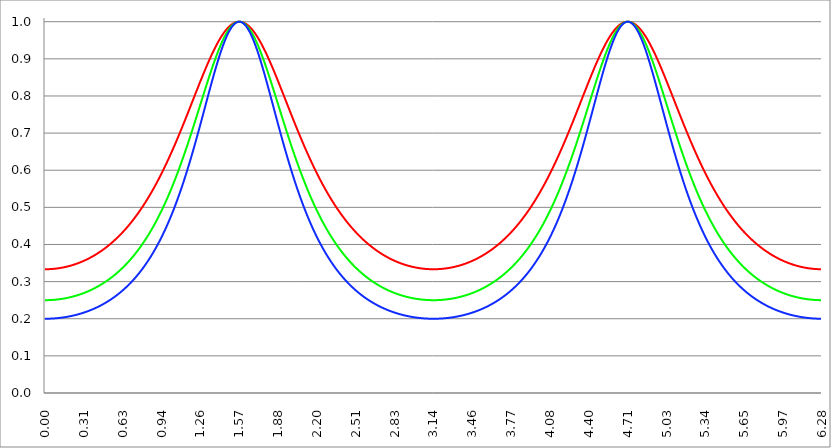
| Category | Series 1 | Series 0 | Series 2 |
|---|---|---|---|
| 0.0 | 0.333 | 0.25 | 0.2 |
| 0.00314159265358979 | 0.333 | 0.25 | 0.2 |
| 0.00628318530717958 | 0.333 | 0.25 | 0.2 |
| 0.00942477796076938 | 0.333 | 0.25 | 0.2 |
| 0.0125663706143592 | 0.333 | 0.25 | 0.2 |
| 0.015707963267949 | 0.333 | 0.25 | 0.2 |
| 0.0188495559215388 | 0.333 | 0.25 | 0.2 |
| 0.0219911485751285 | 0.333 | 0.25 | 0.2 |
| 0.0251327412287183 | 0.333 | 0.25 | 0.2 |
| 0.0282743338823081 | 0.334 | 0.25 | 0.2 |
| 0.0314159265358979 | 0.334 | 0.25 | 0.2 |
| 0.0345575191894877 | 0.334 | 0.25 | 0.2 |
| 0.0376991118430775 | 0.334 | 0.25 | 0.2 |
| 0.0408407044966673 | 0.334 | 0.25 | 0.2 |
| 0.0439822971502571 | 0.334 | 0.25 | 0.2 |
| 0.0471238898038469 | 0.334 | 0.25 | 0.2 |
| 0.0502654824574367 | 0.334 | 0.25 | 0.2 |
| 0.0534070751110265 | 0.334 | 0.251 | 0.2 |
| 0.0565486677646163 | 0.334 | 0.251 | 0.201 |
| 0.059690260418206 | 0.334 | 0.251 | 0.201 |
| 0.0628318530717958 | 0.334 | 0.251 | 0.201 |
| 0.0659734457253856 | 0.334 | 0.251 | 0.201 |
| 0.0691150383789754 | 0.334 | 0.251 | 0.201 |
| 0.0722566310325652 | 0.334 | 0.251 | 0.201 |
| 0.075398223686155 | 0.335 | 0.251 | 0.201 |
| 0.0785398163397448 | 0.335 | 0.251 | 0.201 |
| 0.0816814089933346 | 0.335 | 0.251 | 0.201 |
| 0.0848230016469244 | 0.335 | 0.251 | 0.201 |
| 0.0879645943005142 | 0.335 | 0.251 | 0.201 |
| 0.091106186954104 | 0.335 | 0.252 | 0.201 |
| 0.0942477796076937 | 0.335 | 0.252 | 0.201 |
| 0.0973893722612835 | 0.335 | 0.252 | 0.202 |
| 0.100530964914873 | 0.336 | 0.252 | 0.202 |
| 0.103672557568463 | 0.336 | 0.252 | 0.202 |
| 0.106814150222053 | 0.336 | 0.252 | 0.202 |
| 0.109955742875643 | 0.336 | 0.252 | 0.202 |
| 0.113097335529233 | 0.336 | 0.252 | 0.202 |
| 0.116238928182822 | 0.336 | 0.253 | 0.202 |
| 0.119380520836412 | 0.337 | 0.253 | 0.202 |
| 0.122522113490002 | 0.337 | 0.253 | 0.202 |
| 0.125663706143592 | 0.337 | 0.253 | 0.203 |
| 0.128805298797181 | 0.337 | 0.253 | 0.203 |
| 0.131946891450771 | 0.337 | 0.253 | 0.203 |
| 0.135088484104361 | 0.337 | 0.253 | 0.203 |
| 0.138230076757951 | 0.338 | 0.254 | 0.203 |
| 0.141371669411541 | 0.338 | 0.254 | 0.203 |
| 0.14451326206513 | 0.338 | 0.254 | 0.203 |
| 0.14765485471872 | 0.338 | 0.254 | 0.204 |
| 0.15079644737231 | 0.338 | 0.254 | 0.204 |
| 0.1539380400259 | 0.339 | 0.254 | 0.204 |
| 0.15707963267949 | 0.339 | 0.255 | 0.204 |
| 0.160221225333079 | 0.339 | 0.255 | 0.204 |
| 0.163362817986669 | 0.339 | 0.255 | 0.204 |
| 0.166504410640259 | 0.34 | 0.255 | 0.204 |
| 0.169646003293849 | 0.34 | 0.255 | 0.205 |
| 0.172787595947439 | 0.34 | 0.256 | 0.205 |
| 0.175929188601028 | 0.34 | 0.256 | 0.205 |
| 0.179070781254618 | 0.341 | 0.256 | 0.205 |
| 0.182212373908208 | 0.341 | 0.256 | 0.205 |
| 0.185353966561798 | 0.341 | 0.257 | 0.206 |
| 0.188495559215388 | 0.341 | 0.257 | 0.206 |
| 0.191637151868977 | 0.342 | 0.257 | 0.206 |
| 0.194778744522567 | 0.342 | 0.257 | 0.206 |
| 0.197920337176157 | 0.342 | 0.257 | 0.206 |
| 0.201061929829747 | 0.342 | 0.258 | 0.207 |
| 0.204203522483336 | 0.343 | 0.258 | 0.207 |
| 0.207345115136926 | 0.343 | 0.258 | 0.207 |
| 0.210486707790516 | 0.343 | 0.258 | 0.207 |
| 0.213628300444106 | 0.344 | 0.259 | 0.207 |
| 0.216769893097696 | 0.344 | 0.259 | 0.208 |
| 0.219911485751285 | 0.344 | 0.259 | 0.208 |
| 0.223053078404875 | 0.345 | 0.26 | 0.208 |
| 0.226194671058465 | 0.345 | 0.26 | 0.208 |
| 0.229336263712055 | 0.345 | 0.26 | 0.209 |
| 0.232477856365645 | 0.346 | 0.26 | 0.209 |
| 0.235619449019234 | 0.346 | 0.261 | 0.209 |
| 0.238761041672824 | 0.346 | 0.261 | 0.209 |
| 0.241902634326414 | 0.347 | 0.261 | 0.21 |
| 0.245044226980004 | 0.347 | 0.262 | 0.21 |
| 0.248185819633594 | 0.347 | 0.262 | 0.21 |
| 0.251327412287183 | 0.348 | 0.262 | 0.21 |
| 0.254469004940773 | 0.348 | 0.262 | 0.211 |
| 0.257610597594363 | 0.348 | 0.263 | 0.211 |
| 0.260752190247953 | 0.349 | 0.263 | 0.211 |
| 0.263893782901543 | 0.349 | 0.263 | 0.212 |
| 0.267035375555132 | 0.35 | 0.264 | 0.212 |
| 0.270176968208722 | 0.35 | 0.264 | 0.212 |
| 0.273318560862312 | 0.35 | 0.264 | 0.212 |
| 0.276460153515902 | 0.351 | 0.265 | 0.213 |
| 0.279601746169492 | 0.351 | 0.265 | 0.213 |
| 0.282743338823082 | 0.352 | 0.265 | 0.213 |
| 0.285884931476671 | 0.352 | 0.266 | 0.214 |
| 0.289026524130261 | 0.352 | 0.266 | 0.214 |
| 0.292168116783851 | 0.353 | 0.267 | 0.214 |
| 0.295309709437441 | 0.353 | 0.267 | 0.215 |
| 0.298451302091031 | 0.354 | 0.267 | 0.215 |
| 0.30159289474462 | 0.354 | 0.268 | 0.215 |
| 0.30473448739821 | 0.355 | 0.268 | 0.216 |
| 0.3078760800518 | 0.355 | 0.268 | 0.216 |
| 0.31101767270539 | 0.356 | 0.269 | 0.216 |
| 0.31415926535898 | 0.356 | 0.269 | 0.217 |
| 0.31730085801257 | 0.356 | 0.27 | 0.217 |
| 0.320442450666159 | 0.357 | 0.27 | 0.217 |
| 0.323584043319749 | 0.357 | 0.271 | 0.218 |
| 0.326725635973339 | 0.358 | 0.271 | 0.218 |
| 0.329867228626929 | 0.358 | 0.271 | 0.218 |
| 0.333008821280519 | 0.359 | 0.272 | 0.219 |
| 0.336150413934108 | 0.359 | 0.272 | 0.219 |
| 0.339292006587698 | 0.36 | 0.273 | 0.219 |
| 0.342433599241288 | 0.36 | 0.273 | 0.22 |
| 0.345575191894878 | 0.361 | 0.274 | 0.22 |
| 0.348716784548468 | 0.361 | 0.274 | 0.221 |
| 0.351858377202058 | 0.362 | 0.274 | 0.221 |
| 0.354999969855647 | 0.363 | 0.275 | 0.221 |
| 0.358141562509237 | 0.363 | 0.275 | 0.222 |
| 0.361283155162827 | 0.364 | 0.276 | 0.222 |
| 0.364424747816417 | 0.364 | 0.276 | 0.223 |
| 0.367566340470007 | 0.365 | 0.277 | 0.223 |
| 0.370707933123597 | 0.365 | 0.277 | 0.223 |
| 0.373849525777186 | 0.366 | 0.278 | 0.224 |
| 0.376991118430776 | 0.366 | 0.278 | 0.224 |
| 0.380132711084366 | 0.367 | 0.279 | 0.225 |
| 0.383274303737956 | 0.368 | 0.279 | 0.225 |
| 0.386415896391546 | 0.368 | 0.28 | 0.226 |
| 0.389557489045135 | 0.369 | 0.28 | 0.226 |
| 0.392699081698725 | 0.369 | 0.281 | 0.227 |
| 0.395840674352315 | 0.37 | 0.281 | 0.227 |
| 0.398982267005905 | 0.371 | 0.282 | 0.227 |
| 0.402123859659495 | 0.371 | 0.282 | 0.228 |
| 0.405265452313085 | 0.372 | 0.283 | 0.228 |
| 0.408407044966674 | 0.373 | 0.284 | 0.229 |
| 0.411548637620264 | 0.373 | 0.284 | 0.229 |
| 0.414690230273854 | 0.374 | 0.285 | 0.23 |
| 0.417831822927444 | 0.374 | 0.285 | 0.23 |
| 0.420973415581034 | 0.375 | 0.286 | 0.231 |
| 0.424115008234623 | 0.376 | 0.286 | 0.231 |
| 0.427256600888213 | 0.376 | 0.287 | 0.232 |
| 0.430398193541803 | 0.377 | 0.288 | 0.232 |
| 0.433539786195393 | 0.378 | 0.288 | 0.233 |
| 0.436681378848983 | 0.378 | 0.289 | 0.233 |
| 0.439822971502573 | 0.379 | 0.289 | 0.234 |
| 0.442964564156162 | 0.38 | 0.29 | 0.234 |
| 0.446106156809752 | 0.381 | 0.291 | 0.235 |
| 0.449247749463342 | 0.381 | 0.291 | 0.236 |
| 0.452389342116932 | 0.382 | 0.292 | 0.236 |
| 0.455530934770522 | 0.383 | 0.292 | 0.237 |
| 0.458672527424111 | 0.383 | 0.293 | 0.237 |
| 0.461814120077701 | 0.384 | 0.294 | 0.238 |
| 0.464955712731291 | 0.385 | 0.294 | 0.238 |
| 0.468097305384881 | 0.386 | 0.295 | 0.239 |
| 0.471238898038471 | 0.386 | 0.296 | 0.239 |
| 0.474380490692061 | 0.387 | 0.296 | 0.24 |
| 0.47752208334565 | 0.388 | 0.297 | 0.241 |
| 0.48066367599924 | 0.389 | 0.298 | 0.241 |
| 0.48380526865283 | 0.39 | 0.298 | 0.242 |
| 0.48694686130642 | 0.39 | 0.299 | 0.242 |
| 0.49008845396001 | 0.391 | 0.3 | 0.243 |
| 0.493230046613599 | 0.392 | 0.301 | 0.244 |
| 0.496371639267189 | 0.393 | 0.301 | 0.244 |
| 0.499513231920779 | 0.394 | 0.302 | 0.245 |
| 0.502654824574369 | 0.394 | 0.303 | 0.246 |
| 0.505796417227959 | 0.395 | 0.303 | 0.246 |
| 0.508938009881549 | 0.396 | 0.304 | 0.247 |
| 0.512079602535138 | 0.397 | 0.305 | 0.248 |
| 0.515221195188728 | 0.398 | 0.306 | 0.248 |
| 0.518362787842318 | 0.399 | 0.306 | 0.249 |
| 0.521504380495908 | 0.399 | 0.307 | 0.25 |
| 0.524645973149498 | 0.4 | 0.308 | 0.25 |
| 0.527787565803087 | 0.401 | 0.309 | 0.251 |
| 0.530929158456677 | 0.402 | 0.31 | 0.252 |
| 0.534070751110267 | 0.403 | 0.31 | 0.252 |
| 0.537212343763857 | 0.404 | 0.311 | 0.253 |
| 0.540353936417447 | 0.405 | 0.312 | 0.254 |
| 0.543495529071037 | 0.406 | 0.313 | 0.254 |
| 0.546637121724626 | 0.407 | 0.314 | 0.255 |
| 0.549778714378216 | 0.407 | 0.314 | 0.256 |
| 0.552920307031806 | 0.408 | 0.315 | 0.257 |
| 0.556061899685396 | 0.409 | 0.316 | 0.257 |
| 0.559203492338986 | 0.41 | 0.317 | 0.258 |
| 0.562345084992576 | 0.411 | 0.318 | 0.259 |
| 0.565486677646165 | 0.412 | 0.319 | 0.26 |
| 0.568628270299755 | 0.413 | 0.319 | 0.26 |
| 0.571769862953345 | 0.414 | 0.32 | 0.261 |
| 0.574911455606935 | 0.415 | 0.321 | 0.262 |
| 0.578053048260525 | 0.416 | 0.322 | 0.263 |
| 0.581194640914114 | 0.417 | 0.323 | 0.264 |
| 0.584336233567704 | 0.418 | 0.324 | 0.264 |
| 0.587477826221294 | 0.419 | 0.325 | 0.265 |
| 0.590619418874884 | 0.42 | 0.326 | 0.266 |
| 0.593761011528474 | 0.421 | 0.327 | 0.267 |
| 0.596902604182064 | 0.422 | 0.328 | 0.268 |
| 0.600044196835653 | 0.423 | 0.329 | 0.268 |
| 0.603185789489243 | 0.424 | 0.33 | 0.269 |
| 0.606327382142833 | 0.425 | 0.33 | 0.27 |
| 0.609468974796423 | 0.427 | 0.331 | 0.271 |
| 0.612610567450013 | 0.428 | 0.332 | 0.272 |
| 0.615752160103602 | 0.429 | 0.333 | 0.273 |
| 0.618893752757192 | 0.43 | 0.334 | 0.274 |
| 0.622035345410782 | 0.431 | 0.335 | 0.275 |
| 0.625176938064372 | 0.432 | 0.336 | 0.275 |
| 0.628318530717962 | 0.433 | 0.337 | 0.276 |
| 0.631460123371551 | 0.434 | 0.338 | 0.277 |
| 0.634601716025141 | 0.435 | 0.339 | 0.278 |
| 0.637743308678731 | 0.436 | 0.341 | 0.279 |
| 0.640884901332321 | 0.438 | 0.342 | 0.28 |
| 0.644026493985911 | 0.439 | 0.343 | 0.281 |
| 0.647168086639501 | 0.44 | 0.344 | 0.282 |
| 0.65030967929309 | 0.441 | 0.345 | 0.283 |
| 0.65345127194668 | 0.442 | 0.346 | 0.284 |
| 0.65659286460027 | 0.444 | 0.347 | 0.285 |
| 0.65973445725386 | 0.445 | 0.348 | 0.286 |
| 0.66287604990745 | 0.446 | 0.349 | 0.287 |
| 0.666017642561039 | 0.447 | 0.35 | 0.288 |
| 0.669159235214629 | 0.448 | 0.351 | 0.289 |
| 0.672300827868219 | 0.45 | 0.353 | 0.29 |
| 0.675442420521809 | 0.451 | 0.354 | 0.291 |
| 0.678584013175399 | 0.452 | 0.355 | 0.292 |
| 0.681725605828989 | 0.453 | 0.356 | 0.293 |
| 0.684867198482578 | 0.455 | 0.357 | 0.294 |
| 0.688008791136168 | 0.456 | 0.358 | 0.295 |
| 0.691150383789758 | 0.457 | 0.36 | 0.296 |
| 0.694291976443348 | 0.458 | 0.361 | 0.297 |
| 0.697433569096938 | 0.46 | 0.362 | 0.299 |
| 0.700575161750528 | 0.461 | 0.363 | 0.3 |
| 0.703716754404117 | 0.462 | 0.364 | 0.301 |
| 0.706858347057707 | 0.464 | 0.366 | 0.302 |
| 0.709999939711297 | 0.465 | 0.367 | 0.303 |
| 0.713141532364887 | 0.466 | 0.368 | 0.304 |
| 0.716283125018477 | 0.468 | 0.369 | 0.305 |
| 0.719424717672066 | 0.469 | 0.371 | 0.306 |
| 0.722566310325656 | 0.471 | 0.372 | 0.308 |
| 0.725707902979246 | 0.472 | 0.373 | 0.309 |
| 0.728849495632836 | 0.473 | 0.375 | 0.31 |
| 0.731991088286426 | 0.475 | 0.376 | 0.311 |
| 0.735132680940016 | 0.476 | 0.377 | 0.312 |
| 0.738274273593605 | 0.478 | 0.379 | 0.314 |
| 0.741415866247195 | 0.479 | 0.38 | 0.315 |
| 0.744557458900785 | 0.48 | 0.381 | 0.316 |
| 0.747699051554375 | 0.482 | 0.383 | 0.317 |
| 0.750840644207965 | 0.483 | 0.384 | 0.319 |
| 0.753982236861554 | 0.485 | 0.385 | 0.32 |
| 0.757123829515144 | 0.486 | 0.387 | 0.321 |
| 0.760265422168734 | 0.488 | 0.388 | 0.323 |
| 0.763407014822324 | 0.489 | 0.39 | 0.324 |
| 0.766548607475914 | 0.491 | 0.391 | 0.325 |
| 0.769690200129504 | 0.492 | 0.393 | 0.326 |
| 0.772831792783093 | 0.494 | 0.394 | 0.328 |
| 0.775973385436683 | 0.495 | 0.396 | 0.329 |
| 0.779114978090273 | 0.497 | 0.397 | 0.331 |
| 0.782256570743863 | 0.498 | 0.398 | 0.332 |
| 0.785398163397453 | 0.5 | 0.4 | 0.333 |
| 0.788539756051042 | 0.502 | 0.402 | 0.335 |
| 0.791681348704632 | 0.503 | 0.403 | 0.336 |
| 0.794822941358222 | 0.505 | 0.405 | 0.338 |
| 0.797964534011812 | 0.506 | 0.406 | 0.339 |
| 0.801106126665402 | 0.508 | 0.408 | 0.34 |
| 0.804247719318992 | 0.51 | 0.409 | 0.342 |
| 0.807389311972581 | 0.511 | 0.411 | 0.343 |
| 0.810530904626171 | 0.513 | 0.412 | 0.345 |
| 0.813672497279761 | 0.515 | 0.414 | 0.346 |
| 0.816814089933351 | 0.516 | 0.416 | 0.348 |
| 0.819955682586941 | 0.518 | 0.417 | 0.349 |
| 0.823097275240531 | 0.52 | 0.419 | 0.351 |
| 0.82623886789412 | 0.521 | 0.421 | 0.353 |
| 0.82938046054771 | 0.523 | 0.422 | 0.354 |
| 0.8325220532013 | 0.525 | 0.424 | 0.356 |
| 0.83566364585489 | 0.526 | 0.426 | 0.357 |
| 0.83880523850848 | 0.528 | 0.427 | 0.359 |
| 0.841946831162069 | 0.53 | 0.429 | 0.36 |
| 0.845088423815659 | 0.532 | 0.431 | 0.362 |
| 0.848230016469249 | 0.533 | 0.433 | 0.364 |
| 0.851371609122839 | 0.535 | 0.434 | 0.365 |
| 0.854513201776429 | 0.537 | 0.436 | 0.367 |
| 0.857654794430019 | 0.539 | 0.438 | 0.369 |
| 0.860796387083608 | 0.541 | 0.44 | 0.37 |
| 0.863937979737198 | 0.542 | 0.441 | 0.372 |
| 0.867079572390788 | 0.544 | 0.443 | 0.374 |
| 0.870221165044378 | 0.546 | 0.445 | 0.376 |
| 0.873362757697968 | 0.548 | 0.447 | 0.377 |
| 0.876504350351557 | 0.55 | 0.449 | 0.379 |
| 0.879645943005147 | 0.552 | 0.451 | 0.381 |
| 0.882787535658737 | 0.554 | 0.453 | 0.383 |
| 0.885929128312327 | 0.555 | 0.454 | 0.385 |
| 0.889070720965917 | 0.557 | 0.456 | 0.386 |
| 0.892212313619507 | 0.559 | 0.458 | 0.388 |
| 0.895353906273096 | 0.561 | 0.46 | 0.39 |
| 0.898495498926686 | 0.563 | 0.462 | 0.392 |
| 0.901637091580276 | 0.565 | 0.464 | 0.394 |
| 0.904778684233866 | 0.567 | 0.466 | 0.396 |
| 0.907920276887456 | 0.569 | 0.468 | 0.398 |
| 0.911061869541045 | 0.571 | 0.47 | 0.4 |
| 0.914203462194635 | 0.573 | 0.472 | 0.402 |
| 0.917345054848225 | 0.575 | 0.474 | 0.403 |
| 0.920486647501815 | 0.577 | 0.476 | 0.405 |
| 0.923628240155405 | 0.579 | 0.478 | 0.407 |
| 0.926769832808995 | 0.581 | 0.48 | 0.409 |
| 0.929911425462584 | 0.583 | 0.483 | 0.412 |
| 0.933053018116174 | 0.585 | 0.485 | 0.414 |
| 0.936194610769764 | 0.587 | 0.487 | 0.416 |
| 0.939336203423354 | 0.589 | 0.489 | 0.418 |
| 0.942477796076944 | 0.591 | 0.491 | 0.42 |
| 0.945619388730533 | 0.593 | 0.493 | 0.422 |
| 0.948760981384123 | 0.596 | 0.495 | 0.424 |
| 0.951902574037713 | 0.598 | 0.498 | 0.426 |
| 0.955044166691303 | 0.6 | 0.5 | 0.428 |
| 0.958185759344893 | 0.602 | 0.502 | 0.431 |
| 0.961327351998483 | 0.604 | 0.504 | 0.433 |
| 0.964468944652072 | 0.606 | 0.507 | 0.435 |
| 0.967610537305662 | 0.608 | 0.509 | 0.437 |
| 0.970752129959252 | 0.611 | 0.511 | 0.439 |
| 0.973893722612842 | 0.613 | 0.513 | 0.442 |
| 0.977035315266432 | 0.615 | 0.516 | 0.444 |
| 0.980176907920022 | 0.617 | 0.518 | 0.446 |
| 0.983318500573611 | 0.619 | 0.52 | 0.449 |
| 0.986460093227201 | 0.622 | 0.523 | 0.451 |
| 0.989601685880791 | 0.624 | 0.525 | 0.453 |
| 0.992743278534381 | 0.626 | 0.528 | 0.456 |
| 0.995884871187971 | 0.628 | 0.53 | 0.458 |
| 0.99902646384156 | 0.631 | 0.532 | 0.461 |
| 1.00216805649515 | 0.633 | 0.535 | 0.463 |
| 1.00530964914874 | 0.635 | 0.537 | 0.465 |
| 1.00845124180233 | 0.638 | 0.54 | 0.468 |
| 1.01159283445592 | 0.64 | 0.542 | 0.47 |
| 1.01473442710951 | 0.642 | 0.545 | 0.473 |
| 1.017876019763099 | 0.644 | 0.547 | 0.475 |
| 1.021017612416689 | 0.647 | 0.55 | 0.478 |
| 1.02415920507028 | 0.649 | 0.552 | 0.481 |
| 1.027300797723869 | 0.652 | 0.555 | 0.483 |
| 1.030442390377459 | 0.654 | 0.557 | 0.486 |
| 1.033583983031048 | 0.656 | 0.56 | 0.488 |
| 1.036725575684638 | 0.659 | 0.563 | 0.491 |
| 1.039867168338228 | 0.661 | 0.565 | 0.494 |
| 1.043008760991818 | 0.663 | 0.568 | 0.496 |
| 1.046150353645408 | 0.666 | 0.571 | 0.499 |
| 1.049291946298998 | 0.668 | 0.573 | 0.502 |
| 1.052433538952587 | 0.671 | 0.576 | 0.505 |
| 1.055575131606177 | 0.673 | 0.579 | 0.507 |
| 1.058716724259767 | 0.676 | 0.581 | 0.51 |
| 1.061858316913357 | 0.678 | 0.584 | 0.513 |
| 1.064999909566947 | 0.681 | 0.587 | 0.516 |
| 1.068141502220536 | 0.683 | 0.59 | 0.519 |
| 1.071283094874126 | 0.685 | 0.592 | 0.521 |
| 1.074424687527716 | 0.688 | 0.595 | 0.524 |
| 1.077566280181306 | 0.69 | 0.598 | 0.527 |
| 1.080707872834896 | 0.693 | 0.601 | 0.53 |
| 1.083849465488486 | 0.695 | 0.604 | 0.533 |
| 1.086991058142075 | 0.698 | 0.606 | 0.536 |
| 1.090132650795665 | 0.7 | 0.609 | 0.539 |
| 1.093274243449255 | 0.703 | 0.612 | 0.542 |
| 1.096415836102845 | 0.706 | 0.615 | 0.545 |
| 1.099557428756435 | 0.708 | 0.618 | 0.548 |
| 1.102699021410025 | 0.711 | 0.621 | 0.551 |
| 1.105840614063614 | 0.713 | 0.624 | 0.554 |
| 1.108982206717204 | 0.716 | 0.627 | 0.557 |
| 1.112123799370794 | 0.718 | 0.63 | 0.56 |
| 1.115265392024384 | 0.721 | 0.633 | 0.564 |
| 1.118406984677974 | 0.724 | 0.636 | 0.567 |
| 1.121548577331563 | 0.726 | 0.639 | 0.57 |
| 1.124690169985153 | 0.729 | 0.642 | 0.573 |
| 1.127831762638743 | 0.731 | 0.645 | 0.576 |
| 1.130973355292333 | 0.734 | 0.648 | 0.58 |
| 1.134114947945923 | 0.737 | 0.651 | 0.583 |
| 1.137256540599513 | 0.739 | 0.654 | 0.586 |
| 1.140398133253102 | 0.742 | 0.657 | 0.59 |
| 1.143539725906692 | 0.744 | 0.66 | 0.593 |
| 1.146681318560282 | 0.747 | 0.663 | 0.596 |
| 1.149822911213872 | 0.75 | 0.666 | 0.6 |
| 1.152964503867462 | 0.752 | 0.669 | 0.603 |
| 1.156106096521051 | 0.755 | 0.672 | 0.606 |
| 1.159247689174641 | 0.758 | 0.676 | 0.61 |
| 1.162389281828231 | 0.76 | 0.679 | 0.613 |
| 1.165530874481821 | 0.763 | 0.682 | 0.617 |
| 1.168672467135411 | 0.765 | 0.685 | 0.62 |
| 1.171814059789001 | 0.768 | 0.688 | 0.624 |
| 1.17495565244259 | 0.771 | 0.692 | 0.627 |
| 1.17809724509618 | 0.773 | 0.695 | 0.631 |
| 1.18123883774977 | 0.776 | 0.698 | 0.634 |
| 1.18438043040336 | 0.779 | 0.701 | 0.638 |
| 1.18752202305695 | 0.781 | 0.704 | 0.641 |
| 1.190663615710539 | 0.784 | 0.708 | 0.645 |
| 1.193805208364129 | 0.787 | 0.711 | 0.648 |
| 1.19694680101772 | 0.789 | 0.714 | 0.652 |
| 1.200088393671309 | 0.792 | 0.717 | 0.656 |
| 1.203229986324899 | 0.795 | 0.721 | 0.659 |
| 1.206371578978489 | 0.797 | 0.724 | 0.663 |
| 1.209513171632078 | 0.8 | 0.727 | 0.667 |
| 1.212654764285668 | 0.803 | 0.731 | 0.67 |
| 1.215796356939258 | 0.805 | 0.734 | 0.674 |
| 1.218937949592848 | 0.808 | 0.737 | 0.678 |
| 1.222079542246438 | 0.811 | 0.741 | 0.682 |
| 1.225221134900027 | 0.813 | 0.744 | 0.685 |
| 1.228362727553617 | 0.816 | 0.747 | 0.689 |
| 1.231504320207207 | 0.819 | 0.751 | 0.693 |
| 1.234645912860797 | 0.821 | 0.754 | 0.697 |
| 1.237787505514387 | 0.824 | 0.757 | 0.701 |
| 1.240929098167977 | 0.827 | 0.761 | 0.704 |
| 1.244070690821566 | 0.829 | 0.764 | 0.708 |
| 1.247212283475156 | 0.832 | 0.767 | 0.712 |
| 1.250353876128746 | 0.834 | 0.771 | 0.716 |
| 1.253495468782336 | 0.837 | 0.774 | 0.72 |
| 1.256637061435926 | 0.84 | 0.777 | 0.724 |
| 1.259778654089515 | 0.842 | 0.781 | 0.727 |
| 1.262920246743105 | 0.845 | 0.784 | 0.731 |
| 1.266061839396695 | 0.847 | 0.787 | 0.735 |
| 1.269203432050285 | 0.85 | 0.791 | 0.739 |
| 1.272345024703875 | 0.853 | 0.794 | 0.743 |
| 1.275486617357465 | 0.855 | 0.797 | 0.747 |
| 1.278628210011054 | 0.858 | 0.801 | 0.751 |
| 1.281769802664644 | 0.86 | 0.804 | 0.755 |
| 1.284911395318234 | 0.863 | 0.807 | 0.759 |
| 1.288052987971824 | 0.865 | 0.811 | 0.763 |
| 1.291194580625414 | 0.868 | 0.814 | 0.766 |
| 1.294336173279003 | 0.87 | 0.817 | 0.77 |
| 1.297477765932593 | 0.873 | 0.821 | 0.774 |
| 1.300619358586183 | 0.875 | 0.824 | 0.778 |
| 1.303760951239773 | 0.878 | 0.827 | 0.782 |
| 1.306902543893363 | 0.88 | 0.83 | 0.786 |
| 1.310044136546953 | 0.883 | 0.834 | 0.79 |
| 1.313185729200542 | 0.885 | 0.837 | 0.794 |
| 1.316327321854132 | 0.888 | 0.84 | 0.798 |
| 1.319468914507722 | 0.89 | 0.843 | 0.802 |
| 1.322610507161312 | 0.892 | 0.847 | 0.806 |
| 1.325752099814902 | 0.895 | 0.85 | 0.809 |
| 1.328893692468491 | 0.897 | 0.853 | 0.813 |
| 1.332035285122081 | 0.899 | 0.856 | 0.817 |
| 1.335176877775671 | 0.902 | 0.859 | 0.821 |
| 1.338318470429261 | 0.904 | 0.863 | 0.825 |
| 1.341460063082851 | 0.906 | 0.866 | 0.829 |
| 1.344601655736441 | 0.909 | 0.869 | 0.833 |
| 1.34774324839003 | 0.911 | 0.872 | 0.836 |
| 1.35088484104362 | 0.913 | 0.875 | 0.84 |
| 1.35402643369721 | 0.915 | 0.878 | 0.844 |
| 1.3571680263508 | 0.918 | 0.881 | 0.848 |
| 1.36030961900439 | 0.92 | 0.884 | 0.851 |
| 1.363451211657979 | 0.922 | 0.887 | 0.855 |
| 1.36659280431157 | 0.924 | 0.89 | 0.859 |
| 1.369734396965159 | 0.926 | 0.893 | 0.862 |
| 1.372875989618749 | 0.928 | 0.896 | 0.866 |
| 1.376017582272339 | 0.93 | 0.899 | 0.87 |
| 1.379159174925929 | 0.932 | 0.902 | 0.873 |
| 1.382300767579518 | 0.934 | 0.905 | 0.877 |
| 1.385442360233108 | 0.936 | 0.908 | 0.88 |
| 1.388583952886698 | 0.938 | 0.91 | 0.884 |
| 1.391725545540288 | 0.94 | 0.913 | 0.887 |
| 1.394867138193878 | 0.942 | 0.916 | 0.891 |
| 1.398008730847468 | 0.944 | 0.919 | 0.894 |
| 1.401150323501057 | 0.946 | 0.921 | 0.898 |
| 1.404291916154647 | 0.948 | 0.924 | 0.901 |
| 1.407433508808237 | 0.95 | 0.926 | 0.904 |
| 1.410575101461827 | 0.952 | 0.929 | 0.908 |
| 1.413716694115417 | 0.953 | 0.932 | 0.911 |
| 1.416858286769006 | 0.955 | 0.934 | 0.914 |
| 1.419999879422596 | 0.957 | 0.937 | 0.917 |
| 1.423141472076186 | 0.959 | 0.939 | 0.92 |
| 1.426283064729776 | 0.96 | 0.941 | 0.923 |
| 1.429424657383366 | 0.962 | 0.944 | 0.926 |
| 1.432566250036956 | 0.963 | 0.946 | 0.929 |
| 1.435707842690545 | 0.965 | 0.948 | 0.932 |
| 1.438849435344135 | 0.967 | 0.951 | 0.935 |
| 1.441991027997725 | 0.968 | 0.953 | 0.938 |
| 1.445132620651315 | 0.97 | 0.955 | 0.941 |
| 1.448274213304905 | 0.971 | 0.957 | 0.944 |
| 1.451415805958494 | 0.972 | 0.959 | 0.946 |
| 1.454557398612084 | 0.974 | 0.961 | 0.949 |
| 1.457698991265674 | 0.975 | 0.963 | 0.952 |
| 1.460840583919264 | 0.976 | 0.965 | 0.954 |
| 1.463982176572854 | 0.978 | 0.967 | 0.957 |
| 1.467123769226444 | 0.979 | 0.969 | 0.959 |
| 1.470265361880033 | 0.98 | 0.971 | 0.961 |
| 1.473406954533623 | 0.981 | 0.972 | 0.964 |
| 1.476548547187213 | 0.983 | 0.974 | 0.966 |
| 1.479690139840803 | 0.984 | 0.976 | 0.968 |
| 1.482831732494393 | 0.985 | 0.977 | 0.97 |
| 1.485973325147982 | 0.986 | 0.979 | 0.972 |
| 1.489114917801572 | 0.987 | 0.98 | 0.974 |
| 1.492256510455162 | 0.988 | 0.982 | 0.976 |
| 1.495398103108752 | 0.989 | 0.983 | 0.978 |
| 1.498539695762342 | 0.99 | 0.985 | 0.98 |
| 1.501681288415932 | 0.991 | 0.986 | 0.981 |
| 1.504822881069521 | 0.991 | 0.987 | 0.983 |
| 1.507964473723111 | 0.992 | 0.988 | 0.984 |
| 1.511106066376701 | 0.993 | 0.989 | 0.986 |
| 1.514247659030291 | 0.994 | 0.991 | 0.987 |
| 1.517389251683881 | 0.994 | 0.992 | 0.989 |
| 1.520530844337471 | 0.995 | 0.992 | 0.99 |
| 1.52367243699106 | 0.996 | 0.993 | 0.991 |
| 1.52681402964465 | 0.996 | 0.994 | 0.992 |
| 1.52995562229824 | 0.997 | 0.995 | 0.993 |
| 1.53309721495183 | 0.997 | 0.996 | 0.994 |
| 1.53623880760542 | 0.998 | 0.996 | 0.995 |
| 1.539380400259009 | 0.998 | 0.997 | 0.996 |
| 1.542521992912599 | 0.998 | 0.998 | 0.997 |
| 1.545663585566189 | 0.999 | 0.998 | 0.997 |
| 1.548805178219779 | 0.999 | 0.999 | 0.998 |
| 1.551946770873369 | 0.999 | 0.999 | 0.999 |
| 1.555088363526959 | 1 | 0.999 | 0.999 |
| 1.558229956180548 | 1 | 1 | 0.999 |
| 1.561371548834138 | 1 | 1 | 1 |
| 1.564513141487728 | 1 | 1 | 1 |
| 1.567654734141318 | 1 | 1 | 1 |
| 1.570796326794908 | 1 | 1 | 1 |
| 1.573937919448497 | 1 | 1 | 1 |
| 1.577079512102087 | 1 | 1 | 1 |
| 1.580221104755677 | 1 | 1 | 1 |
| 1.583362697409267 | 1 | 1 | 0.999 |
| 1.586504290062857 | 1 | 0.999 | 0.999 |
| 1.589645882716447 | 0.999 | 0.999 | 0.999 |
| 1.592787475370036 | 0.999 | 0.999 | 0.998 |
| 1.595929068023626 | 0.999 | 0.998 | 0.997 |
| 1.599070660677216 | 0.998 | 0.998 | 0.997 |
| 1.602212253330806 | 0.998 | 0.997 | 0.996 |
| 1.605353845984396 | 0.998 | 0.996 | 0.995 |
| 1.608495438637985 | 0.997 | 0.996 | 0.994 |
| 1.611637031291575 | 0.997 | 0.995 | 0.993 |
| 1.614778623945165 | 0.996 | 0.994 | 0.992 |
| 1.617920216598755 | 0.996 | 0.993 | 0.991 |
| 1.621061809252345 | 0.995 | 0.992 | 0.99 |
| 1.624203401905935 | 0.994 | 0.992 | 0.989 |
| 1.627344994559524 | 0.994 | 0.991 | 0.987 |
| 1.630486587213114 | 0.993 | 0.989 | 0.986 |
| 1.633628179866704 | 0.992 | 0.988 | 0.984 |
| 1.636769772520294 | 0.991 | 0.987 | 0.983 |
| 1.639911365173884 | 0.991 | 0.986 | 0.981 |
| 1.643052957827473 | 0.99 | 0.985 | 0.98 |
| 1.646194550481063 | 0.989 | 0.983 | 0.978 |
| 1.649336143134653 | 0.988 | 0.982 | 0.976 |
| 1.652477735788243 | 0.987 | 0.98 | 0.974 |
| 1.655619328441833 | 0.986 | 0.979 | 0.972 |
| 1.658760921095423 | 0.985 | 0.977 | 0.97 |
| 1.661902513749012 | 0.984 | 0.976 | 0.968 |
| 1.665044106402602 | 0.983 | 0.974 | 0.966 |
| 1.668185699056192 | 0.981 | 0.972 | 0.964 |
| 1.671327291709782 | 0.98 | 0.971 | 0.961 |
| 1.674468884363372 | 0.979 | 0.969 | 0.959 |
| 1.677610477016961 | 0.978 | 0.967 | 0.957 |
| 1.680752069670551 | 0.976 | 0.965 | 0.954 |
| 1.683893662324141 | 0.975 | 0.963 | 0.952 |
| 1.687035254977731 | 0.974 | 0.961 | 0.949 |
| 1.690176847631321 | 0.972 | 0.959 | 0.946 |
| 1.693318440284911 | 0.971 | 0.957 | 0.944 |
| 1.6964600329385 | 0.97 | 0.955 | 0.941 |
| 1.69960162559209 | 0.968 | 0.953 | 0.938 |
| 1.70274321824568 | 0.967 | 0.951 | 0.935 |
| 1.70588481089927 | 0.965 | 0.948 | 0.932 |
| 1.70902640355286 | 0.963 | 0.946 | 0.929 |
| 1.712167996206449 | 0.962 | 0.944 | 0.926 |
| 1.715309588860039 | 0.96 | 0.941 | 0.923 |
| 1.71845118151363 | 0.959 | 0.939 | 0.92 |
| 1.721592774167219 | 0.957 | 0.937 | 0.917 |
| 1.724734366820809 | 0.955 | 0.934 | 0.914 |
| 1.727875959474399 | 0.953 | 0.932 | 0.911 |
| 1.731017552127988 | 0.952 | 0.929 | 0.908 |
| 1.734159144781578 | 0.95 | 0.926 | 0.904 |
| 1.737300737435168 | 0.948 | 0.924 | 0.901 |
| 1.740442330088758 | 0.946 | 0.921 | 0.898 |
| 1.743583922742348 | 0.944 | 0.919 | 0.894 |
| 1.746725515395937 | 0.942 | 0.916 | 0.891 |
| 1.749867108049527 | 0.94 | 0.913 | 0.887 |
| 1.753008700703117 | 0.938 | 0.91 | 0.884 |
| 1.756150293356707 | 0.936 | 0.908 | 0.88 |
| 1.759291886010297 | 0.934 | 0.905 | 0.877 |
| 1.762433478663887 | 0.932 | 0.902 | 0.873 |
| 1.765575071317476 | 0.93 | 0.899 | 0.87 |
| 1.768716663971066 | 0.928 | 0.896 | 0.866 |
| 1.771858256624656 | 0.926 | 0.893 | 0.862 |
| 1.774999849278246 | 0.924 | 0.89 | 0.859 |
| 1.778141441931836 | 0.922 | 0.887 | 0.855 |
| 1.781283034585426 | 0.92 | 0.884 | 0.851 |
| 1.784424627239015 | 0.918 | 0.881 | 0.848 |
| 1.787566219892605 | 0.915 | 0.878 | 0.844 |
| 1.790707812546195 | 0.913 | 0.875 | 0.84 |
| 1.793849405199785 | 0.911 | 0.872 | 0.836 |
| 1.796990997853375 | 0.909 | 0.869 | 0.833 |
| 1.800132590506964 | 0.906 | 0.866 | 0.829 |
| 1.803274183160554 | 0.904 | 0.863 | 0.825 |
| 1.806415775814144 | 0.902 | 0.859 | 0.821 |
| 1.809557368467734 | 0.899 | 0.856 | 0.817 |
| 1.812698961121324 | 0.897 | 0.853 | 0.813 |
| 1.815840553774914 | 0.895 | 0.85 | 0.809 |
| 1.818982146428503 | 0.892 | 0.847 | 0.806 |
| 1.822123739082093 | 0.89 | 0.843 | 0.802 |
| 1.825265331735683 | 0.888 | 0.84 | 0.798 |
| 1.828406924389273 | 0.885 | 0.837 | 0.794 |
| 1.831548517042863 | 0.883 | 0.834 | 0.79 |
| 1.834690109696452 | 0.88 | 0.83 | 0.786 |
| 1.837831702350042 | 0.878 | 0.827 | 0.782 |
| 1.840973295003632 | 0.875 | 0.824 | 0.778 |
| 1.844114887657222 | 0.873 | 0.821 | 0.774 |
| 1.847256480310812 | 0.87 | 0.817 | 0.77 |
| 1.850398072964402 | 0.868 | 0.814 | 0.766 |
| 1.853539665617991 | 0.865 | 0.811 | 0.763 |
| 1.856681258271581 | 0.863 | 0.807 | 0.759 |
| 1.859822850925171 | 0.86 | 0.804 | 0.755 |
| 1.862964443578761 | 0.858 | 0.801 | 0.751 |
| 1.866106036232351 | 0.855 | 0.797 | 0.747 |
| 1.86924762888594 | 0.853 | 0.794 | 0.743 |
| 1.87238922153953 | 0.85 | 0.791 | 0.739 |
| 1.87553081419312 | 0.847 | 0.787 | 0.735 |
| 1.87867240684671 | 0.845 | 0.784 | 0.731 |
| 1.8818139995003 | 0.842 | 0.781 | 0.727 |
| 1.88495559215389 | 0.84 | 0.777 | 0.724 |
| 1.888097184807479 | 0.837 | 0.774 | 0.72 |
| 1.891238777461069 | 0.834 | 0.771 | 0.716 |
| 1.89438037011466 | 0.832 | 0.767 | 0.712 |
| 1.897521962768249 | 0.829 | 0.764 | 0.708 |
| 1.900663555421839 | 0.827 | 0.761 | 0.704 |
| 1.903805148075429 | 0.824 | 0.757 | 0.701 |
| 1.906946740729018 | 0.821 | 0.754 | 0.697 |
| 1.910088333382608 | 0.819 | 0.751 | 0.693 |
| 1.913229926036198 | 0.816 | 0.747 | 0.689 |
| 1.916371518689788 | 0.813 | 0.744 | 0.685 |
| 1.919513111343378 | 0.811 | 0.741 | 0.682 |
| 1.922654703996967 | 0.808 | 0.737 | 0.678 |
| 1.925796296650557 | 0.805 | 0.734 | 0.674 |
| 1.928937889304147 | 0.803 | 0.731 | 0.67 |
| 1.932079481957737 | 0.8 | 0.727 | 0.667 |
| 1.935221074611327 | 0.797 | 0.724 | 0.663 |
| 1.938362667264917 | 0.795 | 0.721 | 0.659 |
| 1.941504259918506 | 0.792 | 0.717 | 0.656 |
| 1.944645852572096 | 0.789 | 0.714 | 0.652 |
| 1.947787445225686 | 0.787 | 0.711 | 0.648 |
| 1.950929037879276 | 0.784 | 0.708 | 0.645 |
| 1.954070630532866 | 0.781 | 0.704 | 0.641 |
| 1.957212223186455 | 0.779 | 0.701 | 0.638 |
| 1.960353815840045 | 0.776 | 0.698 | 0.634 |
| 1.963495408493635 | 0.773 | 0.695 | 0.631 |
| 1.966637001147225 | 0.771 | 0.692 | 0.627 |
| 1.969778593800815 | 0.768 | 0.688 | 0.624 |
| 1.972920186454405 | 0.765 | 0.685 | 0.62 |
| 1.976061779107994 | 0.763 | 0.682 | 0.617 |
| 1.979203371761584 | 0.76 | 0.679 | 0.613 |
| 1.982344964415174 | 0.758 | 0.676 | 0.61 |
| 1.985486557068764 | 0.755 | 0.672 | 0.606 |
| 1.988628149722354 | 0.752 | 0.669 | 0.603 |
| 1.991769742375943 | 0.75 | 0.666 | 0.6 |
| 1.994911335029533 | 0.747 | 0.663 | 0.596 |
| 1.998052927683123 | 0.744 | 0.66 | 0.593 |
| 2.001194520336712 | 0.742 | 0.657 | 0.59 |
| 2.004336112990302 | 0.739 | 0.654 | 0.586 |
| 2.007477705643892 | 0.737 | 0.651 | 0.583 |
| 2.010619298297482 | 0.734 | 0.648 | 0.58 |
| 2.013760890951071 | 0.731 | 0.645 | 0.576 |
| 2.016902483604661 | 0.729 | 0.642 | 0.573 |
| 2.02004407625825 | 0.726 | 0.639 | 0.57 |
| 2.02318566891184 | 0.724 | 0.636 | 0.567 |
| 2.02632726156543 | 0.721 | 0.633 | 0.564 |
| 2.029468854219019 | 0.718 | 0.63 | 0.56 |
| 2.032610446872609 | 0.716 | 0.627 | 0.557 |
| 2.035752039526198 | 0.713 | 0.624 | 0.554 |
| 2.038893632179788 | 0.711 | 0.621 | 0.551 |
| 2.042035224833378 | 0.708 | 0.618 | 0.548 |
| 2.045176817486967 | 0.706 | 0.615 | 0.545 |
| 2.048318410140557 | 0.703 | 0.612 | 0.542 |
| 2.051460002794146 | 0.7 | 0.609 | 0.539 |
| 2.054601595447736 | 0.698 | 0.606 | 0.536 |
| 2.057743188101325 | 0.695 | 0.604 | 0.533 |
| 2.060884780754915 | 0.693 | 0.601 | 0.53 |
| 2.064026373408505 | 0.69 | 0.598 | 0.527 |
| 2.067167966062094 | 0.688 | 0.595 | 0.524 |
| 2.070309558715684 | 0.685 | 0.592 | 0.521 |
| 2.073451151369273 | 0.683 | 0.59 | 0.519 |
| 2.076592744022863 | 0.681 | 0.587 | 0.516 |
| 2.079734336676452 | 0.678 | 0.584 | 0.513 |
| 2.082875929330042 | 0.676 | 0.581 | 0.51 |
| 2.086017521983632 | 0.673 | 0.579 | 0.507 |
| 2.089159114637221 | 0.671 | 0.576 | 0.505 |
| 2.092300707290811 | 0.668 | 0.573 | 0.502 |
| 2.095442299944401 | 0.666 | 0.571 | 0.499 |
| 2.09858389259799 | 0.663 | 0.568 | 0.496 |
| 2.10172548525158 | 0.661 | 0.565 | 0.494 |
| 2.104867077905169 | 0.659 | 0.563 | 0.491 |
| 2.108008670558759 | 0.656 | 0.56 | 0.488 |
| 2.111150263212349 | 0.654 | 0.557 | 0.486 |
| 2.114291855865938 | 0.652 | 0.555 | 0.483 |
| 2.117433448519528 | 0.649 | 0.552 | 0.481 |
| 2.120575041173117 | 0.647 | 0.55 | 0.478 |
| 2.123716633826707 | 0.644 | 0.547 | 0.475 |
| 2.126858226480297 | 0.642 | 0.545 | 0.473 |
| 2.129999819133886 | 0.64 | 0.542 | 0.47 |
| 2.133141411787476 | 0.638 | 0.54 | 0.468 |
| 2.136283004441065 | 0.635 | 0.537 | 0.465 |
| 2.139424597094655 | 0.633 | 0.535 | 0.463 |
| 2.142566189748245 | 0.631 | 0.532 | 0.461 |
| 2.145707782401834 | 0.628 | 0.53 | 0.458 |
| 2.148849375055424 | 0.626 | 0.528 | 0.456 |
| 2.151990967709013 | 0.624 | 0.525 | 0.453 |
| 2.155132560362603 | 0.622 | 0.523 | 0.451 |
| 2.158274153016193 | 0.619 | 0.52 | 0.449 |
| 2.161415745669782 | 0.617 | 0.518 | 0.446 |
| 2.164557338323372 | 0.615 | 0.516 | 0.444 |
| 2.167698930976961 | 0.613 | 0.513 | 0.442 |
| 2.170840523630551 | 0.611 | 0.511 | 0.439 |
| 2.173982116284141 | 0.608 | 0.509 | 0.437 |
| 2.17712370893773 | 0.606 | 0.507 | 0.435 |
| 2.18026530159132 | 0.604 | 0.504 | 0.433 |
| 2.183406894244909 | 0.602 | 0.502 | 0.431 |
| 2.186548486898499 | 0.6 | 0.5 | 0.428 |
| 2.189690079552089 | 0.598 | 0.498 | 0.426 |
| 2.192831672205678 | 0.596 | 0.495 | 0.424 |
| 2.195973264859268 | 0.593 | 0.493 | 0.422 |
| 2.199114857512857 | 0.591 | 0.491 | 0.42 |
| 2.202256450166447 | 0.589 | 0.489 | 0.418 |
| 2.205398042820036 | 0.587 | 0.487 | 0.416 |
| 2.208539635473626 | 0.585 | 0.485 | 0.414 |
| 2.211681228127216 | 0.583 | 0.483 | 0.412 |
| 2.214822820780805 | 0.581 | 0.48 | 0.409 |
| 2.217964413434395 | 0.579 | 0.478 | 0.407 |
| 2.221106006087984 | 0.577 | 0.476 | 0.405 |
| 2.224247598741574 | 0.575 | 0.474 | 0.403 |
| 2.227389191395164 | 0.573 | 0.472 | 0.402 |
| 2.230530784048753 | 0.571 | 0.47 | 0.4 |
| 2.233672376702343 | 0.569 | 0.468 | 0.398 |
| 2.236813969355933 | 0.567 | 0.466 | 0.396 |
| 2.239955562009522 | 0.565 | 0.464 | 0.394 |
| 2.243097154663112 | 0.563 | 0.462 | 0.392 |
| 2.246238747316701 | 0.561 | 0.46 | 0.39 |
| 2.249380339970291 | 0.559 | 0.458 | 0.388 |
| 2.252521932623881 | 0.557 | 0.456 | 0.386 |
| 2.25566352527747 | 0.555 | 0.454 | 0.385 |
| 2.25880511793106 | 0.554 | 0.453 | 0.383 |
| 2.261946710584649 | 0.552 | 0.451 | 0.381 |
| 2.265088303238239 | 0.55 | 0.449 | 0.379 |
| 2.268229895891829 | 0.548 | 0.447 | 0.377 |
| 2.271371488545418 | 0.546 | 0.445 | 0.376 |
| 2.274513081199008 | 0.544 | 0.443 | 0.374 |
| 2.277654673852597 | 0.542 | 0.441 | 0.372 |
| 2.280796266506186 | 0.541 | 0.44 | 0.37 |
| 2.283937859159776 | 0.539 | 0.438 | 0.369 |
| 2.287079451813366 | 0.537 | 0.436 | 0.367 |
| 2.290221044466955 | 0.535 | 0.434 | 0.365 |
| 2.293362637120545 | 0.533 | 0.433 | 0.364 |
| 2.296504229774135 | 0.532 | 0.431 | 0.362 |
| 2.299645822427724 | 0.53 | 0.429 | 0.36 |
| 2.302787415081314 | 0.528 | 0.427 | 0.359 |
| 2.305929007734904 | 0.526 | 0.426 | 0.357 |
| 2.309070600388493 | 0.525 | 0.424 | 0.356 |
| 2.312212193042083 | 0.523 | 0.422 | 0.354 |
| 2.315353785695672 | 0.521 | 0.421 | 0.353 |
| 2.318495378349262 | 0.52 | 0.419 | 0.351 |
| 2.321636971002852 | 0.518 | 0.417 | 0.349 |
| 2.324778563656441 | 0.516 | 0.416 | 0.348 |
| 2.327920156310031 | 0.515 | 0.414 | 0.346 |
| 2.33106174896362 | 0.513 | 0.412 | 0.345 |
| 2.33420334161721 | 0.511 | 0.411 | 0.343 |
| 2.3373449342708 | 0.51 | 0.409 | 0.342 |
| 2.340486526924389 | 0.508 | 0.408 | 0.34 |
| 2.343628119577979 | 0.506 | 0.406 | 0.339 |
| 2.346769712231568 | 0.505 | 0.405 | 0.338 |
| 2.349911304885158 | 0.503 | 0.403 | 0.336 |
| 2.353052897538748 | 0.502 | 0.402 | 0.335 |
| 2.356194490192337 | 0.5 | 0.4 | 0.333 |
| 2.359336082845927 | 0.498 | 0.398 | 0.332 |
| 2.362477675499516 | 0.497 | 0.397 | 0.331 |
| 2.365619268153106 | 0.495 | 0.396 | 0.329 |
| 2.368760860806696 | 0.494 | 0.394 | 0.328 |
| 2.371902453460285 | 0.492 | 0.393 | 0.326 |
| 2.375044046113875 | 0.491 | 0.391 | 0.325 |
| 2.378185638767464 | 0.489 | 0.39 | 0.324 |
| 2.381327231421054 | 0.488 | 0.388 | 0.323 |
| 2.384468824074644 | 0.486 | 0.387 | 0.321 |
| 2.387610416728233 | 0.485 | 0.385 | 0.32 |
| 2.390752009381823 | 0.483 | 0.384 | 0.319 |
| 2.393893602035412 | 0.482 | 0.383 | 0.317 |
| 2.397035194689002 | 0.48 | 0.381 | 0.316 |
| 2.400176787342591 | 0.479 | 0.38 | 0.315 |
| 2.403318379996181 | 0.478 | 0.379 | 0.314 |
| 2.406459972649771 | 0.476 | 0.377 | 0.312 |
| 2.40960156530336 | 0.475 | 0.376 | 0.311 |
| 2.41274315795695 | 0.473 | 0.375 | 0.31 |
| 2.41588475061054 | 0.472 | 0.373 | 0.309 |
| 2.419026343264129 | 0.471 | 0.372 | 0.308 |
| 2.422167935917719 | 0.469 | 0.371 | 0.306 |
| 2.425309528571308 | 0.468 | 0.369 | 0.305 |
| 2.428451121224898 | 0.466 | 0.368 | 0.304 |
| 2.431592713878488 | 0.465 | 0.367 | 0.303 |
| 2.434734306532077 | 0.464 | 0.366 | 0.302 |
| 2.437875899185667 | 0.462 | 0.364 | 0.301 |
| 2.441017491839256 | 0.461 | 0.363 | 0.3 |
| 2.444159084492846 | 0.46 | 0.362 | 0.299 |
| 2.447300677146435 | 0.458 | 0.361 | 0.297 |
| 2.450442269800025 | 0.457 | 0.36 | 0.296 |
| 2.453583862453615 | 0.456 | 0.358 | 0.295 |
| 2.456725455107204 | 0.455 | 0.357 | 0.294 |
| 2.459867047760794 | 0.453 | 0.356 | 0.293 |
| 2.463008640414384 | 0.452 | 0.355 | 0.292 |
| 2.466150233067973 | 0.451 | 0.354 | 0.291 |
| 2.469291825721563 | 0.45 | 0.353 | 0.29 |
| 2.472433418375152 | 0.448 | 0.351 | 0.289 |
| 2.475575011028742 | 0.447 | 0.35 | 0.288 |
| 2.478716603682332 | 0.446 | 0.349 | 0.287 |
| 2.481858196335921 | 0.445 | 0.348 | 0.286 |
| 2.48499978898951 | 0.444 | 0.347 | 0.285 |
| 2.4881413816431 | 0.442 | 0.346 | 0.284 |
| 2.49128297429669 | 0.441 | 0.345 | 0.283 |
| 2.49442456695028 | 0.44 | 0.344 | 0.282 |
| 2.497566159603869 | 0.439 | 0.343 | 0.281 |
| 2.500707752257458 | 0.438 | 0.342 | 0.28 |
| 2.503849344911048 | 0.436 | 0.341 | 0.279 |
| 2.506990937564638 | 0.435 | 0.339 | 0.278 |
| 2.510132530218228 | 0.434 | 0.338 | 0.277 |
| 2.513274122871817 | 0.433 | 0.337 | 0.276 |
| 2.516415715525407 | 0.432 | 0.336 | 0.275 |
| 2.519557308178996 | 0.431 | 0.335 | 0.275 |
| 2.522698900832586 | 0.43 | 0.334 | 0.274 |
| 2.525840493486176 | 0.429 | 0.333 | 0.273 |
| 2.528982086139765 | 0.428 | 0.332 | 0.272 |
| 2.532123678793355 | 0.427 | 0.331 | 0.271 |
| 2.535265271446944 | 0.425 | 0.33 | 0.27 |
| 2.538406864100534 | 0.424 | 0.33 | 0.269 |
| 2.541548456754124 | 0.423 | 0.329 | 0.268 |
| 2.544690049407713 | 0.422 | 0.328 | 0.268 |
| 2.547831642061302 | 0.421 | 0.327 | 0.267 |
| 2.550973234714892 | 0.42 | 0.326 | 0.266 |
| 2.554114827368482 | 0.419 | 0.325 | 0.265 |
| 2.557256420022072 | 0.418 | 0.324 | 0.264 |
| 2.560398012675661 | 0.417 | 0.323 | 0.264 |
| 2.563539605329251 | 0.416 | 0.322 | 0.263 |
| 2.56668119798284 | 0.415 | 0.321 | 0.262 |
| 2.56982279063643 | 0.414 | 0.32 | 0.261 |
| 2.57296438329002 | 0.413 | 0.319 | 0.26 |
| 2.576105975943609 | 0.412 | 0.319 | 0.26 |
| 2.579247568597199 | 0.411 | 0.318 | 0.259 |
| 2.582389161250788 | 0.41 | 0.317 | 0.258 |
| 2.585530753904377 | 0.409 | 0.316 | 0.257 |
| 2.588672346557967 | 0.408 | 0.315 | 0.257 |
| 2.591813939211557 | 0.407 | 0.314 | 0.256 |
| 2.594955531865147 | 0.407 | 0.314 | 0.255 |
| 2.598097124518736 | 0.406 | 0.313 | 0.254 |
| 2.601238717172326 | 0.405 | 0.312 | 0.254 |
| 2.604380309825915 | 0.404 | 0.311 | 0.253 |
| 2.607521902479505 | 0.403 | 0.31 | 0.252 |
| 2.610663495133095 | 0.402 | 0.31 | 0.252 |
| 2.613805087786684 | 0.401 | 0.309 | 0.251 |
| 2.616946680440274 | 0.4 | 0.308 | 0.25 |
| 2.620088273093863 | 0.399 | 0.307 | 0.25 |
| 2.623229865747452 | 0.399 | 0.306 | 0.249 |
| 2.626371458401042 | 0.398 | 0.306 | 0.248 |
| 2.629513051054632 | 0.397 | 0.305 | 0.248 |
| 2.632654643708222 | 0.396 | 0.304 | 0.247 |
| 2.635796236361811 | 0.395 | 0.303 | 0.246 |
| 2.638937829015401 | 0.394 | 0.303 | 0.246 |
| 2.642079421668991 | 0.394 | 0.302 | 0.245 |
| 2.64522101432258 | 0.393 | 0.301 | 0.244 |
| 2.64836260697617 | 0.392 | 0.301 | 0.244 |
| 2.651504199629759 | 0.391 | 0.3 | 0.243 |
| 2.654645792283349 | 0.39 | 0.299 | 0.242 |
| 2.657787384936938 | 0.39 | 0.298 | 0.242 |
| 2.660928977590528 | 0.389 | 0.298 | 0.241 |
| 2.664070570244118 | 0.388 | 0.297 | 0.241 |
| 2.667212162897707 | 0.387 | 0.296 | 0.24 |
| 2.670353755551297 | 0.386 | 0.296 | 0.239 |
| 2.673495348204887 | 0.386 | 0.295 | 0.239 |
| 2.676636940858476 | 0.385 | 0.294 | 0.238 |
| 2.679778533512066 | 0.384 | 0.294 | 0.238 |
| 2.682920126165655 | 0.383 | 0.293 | 0.237 |
| 2.686061718819245 | 0.383 | 0.292 | 0.237 |
| 2.689203311472835 | 0.382 | 0.292 | 0.236 |
| 2.692344904126424 | 0.381 | 0.291 | 0.236 |
| 2.695486496780014 | 0.381 | 0.291 | 0.235 |
| 2.698628089433603 | 0.38 | 0.29 | 0.234 |
| 2.701769682087193 | 0.379 | 0.289 | 0.234 |
| 2.704911274740782 | 0.378 | 0.289 | 0.233 |
| 2.708052867394372 | 0.378 | 0.288 | 0.233 |
| 2.711194460047962 | 0.377 | 0.288 | 0.232 |
| 2.714336052701551 | 0.376 | 0.287 | 0.232 |
| 2.717477645355141 | 0.376 | 0.286 | 0.231 |
| 2.720619238008731 | 0.375 | 0.286 | 0.231 |
| 2.72376083066232 | 0.374 | 0.285 | 0.23 |
| 2.72690242331591 | 0.374 | 0.285 | 0.23 |
| 2.730044015969499 | 0.373 | 0.284 | 0.229 |
| 2.733185608623089 | 0.373 | 0.284 | 0.229 |
| 2.736327201276678 | 0.372 | 0.283 | 0.228 |
| 2.739468793930268 | 0.371 | 0.282 | 0.228 |
| 2.742610386583858 | 0.371 | 0.282 | 0.227 |
| 2.745751979237447 | 0.37 | 0.281 | 0.227 |
| 2.748893571891036 | 0.369 | 0.281 | 0.227 |
| 2.752035164544627 | 0.369 | 0.28 | 0.226 |
| 2.755176757198216 | 0.368 | 0.28 | 0.226 |
| 2.758318349851806 | 0.368 | 0.279 | 0.225 |
| 2.761459942505395 | 0.367 | 0.279 | 0.225 |
| 2.764601535158985 | 0.366 | 0.278 | 0.224 |
| 2.767743127812574 | 0.366 | 0.278 | 0.224 |
| 2.770884720466164 | 0.365 | 0.277 | 0.223 |
| 2.774026313119754 | 0.365 | 0.277 | 0.223 |
| 2.777167905773343 | 0.364 | 0.276 | 0.223 |
| 2.780309498426932 | 0.364 | 0.276 | 0.222 |
| 2.783451091080522 | 0.363 | 0.275 | 0.222 |
| 2.786592683734112 | 0.363 | 0.275 | 0.221 |
| 2.789734276387701 | 0.362 | 0.274 | 0.221 |
| 2.792875869041291 | 0.361 | 0.274 | 0.221 |
| 2.796017461694881 | 0.361 | 0.274 | 0.22 |
| 2.79915905434847 | 0.36 | 0.273 | 0.22 |
| 2.80230064700206 | 0.36 | 0.273 | 0.219 |
| 2.80544223965565 | 0.359 | 0.272 | 0.219 |
| 2.808583832309239 | 0.359 | 0.272 | 0.219 |
| 2.811725424962829 | 0.358 | 0.271 | 0.218 |
| 2.814867017616419 | 0.358 | 0.271 | 0.218 |
| 2.818008610270008 | 0.357 | 0.271 | 0.218 |
| 2.821150202923598 | 0.357 | 0.27 | 0.217 |
| 2.824291795577187 | 0.356 | 0.27 | 0.217 |
| 2.827433388230777 | 0.356 | 0.269 | 0.217 |
| 2.830574980884366 | 0.356 | 0.269 | 0.216 |
| 2.833716573537956 | 0.355 | 0.268 | 0.216 |
| 2.836858166191546 | 0.355 | 0.268 | 0.216 |
| 2.839999758845135 | 0.354 | 0.268 | 0.215 |
| 2.843141351498725 | 0.354 | 0.267 | 0.215 |
| 2.846282944152314 | 0.353 | 0.267 | 0.215 |
| 2.849424536805904 | 0.353 | 0.267 | 0.214 |
| 2.852566129459494 | 0.352 | 0.266 | 0.214 |
| 2.855707722113083 | 0.352 | 0.266 | 0.214 |
| 2.858849314766673 | 0.352 | 0.265 | 0.213 |
| 2.861990907420262 | 0.351 | 0.265 | 0.213 |
| 2.865132500073852 | 0.351 | 0.265 | 0.213 |
| 2.868274092727442 | 0.35 | 0.264 | 0.212 |
| 2.871415685381031 | 0.35 | 0.264 | 0.212 |
| 2.874557278034621 | 0.35 | 0.264 | 0.212 |
| 2.87769887068821 | 0.349 | 0.263 | 0.212 |
| 2.8808404633418 | 0.349 | 0.263 | 0.211 |
| 2.88398205599539 | 0.348 | 0.263 | 0.211 |
| 2.88712364864898 | 0.348 | 0.262 | 0.211 |
| 2.890265241302569 | 0.348 | 0.262 | 0.21 |
| 2.893406833956158 | 0.347 | 0.262 | 0.21 |
| 2.896548426609748 | 0.347 | 0.262 | 0.21 |
| 2.899690019263338 | 0.347 | 0.261 | 0.21 |
| 2.902831611916927 | 0.346 | 0.261 | 0.209 |
| 2.905973204570517 | 0.346 | 0.261 | 0.209 |
| 2.909114797224106 | 0.346 | 0.26 | 0.209 |
| 2.912256389877696 | 0.345 | 0.26 | 0.209 |
| 2.915397982531286 | 0.345 | 0.26 | 0.208 |
| 2.918539575184875 | 0.345 | 0.26 | 0.208 |
| 2.921681167838465 | 0.344 | 0.259 | 0.208 |
| 2.924822760492054 | 0.344 | 0.259 | 0.208 |
| 2.927964353145644 | 0.344 | 0.259 | 0.207 |
| 2.931105945799234 | 0.343 | 0.258 | 0.207 |
| 2.934247538452823 | 0.343 | 0.258 | 0.207 |
| 2.937389131106413 | 0.343 | 0.258 | 0.207 |
| 2.940530723760002 | 0.342 | 0.258 | 0.207 |
| 2.943672316413592 | 0.342 | 0.257 | 0.206 |
| 2.946813909067182 | 0.342 | 0.257 | 0.206 |
| 2.949955501720771 | 0.342 | 0.257 | 0.206 |
| 2.953097094374361 | 0.341 | 0.257 | 0.206 |
| 2.95623868702795 | 0.341 | 0.257 | 0.206 |
| 2.95938027968154 | 0.341 | 0.256 | 0.205 |
| 2.96252187233513 | 0.341 | 0.256 | 0.205 |
| 2.965663464988719 | 0.34 | 0.256 | 0.205 |
| 2.968805057642309 | 0.34 | 0.256 | 0.205 |
| 2.971946650295898 | 0.34 | 0.255 | 0.205 |
| 2.975088242949488 | 0.34 | 0.255 | 0.204 |
| 2.978229835603078 | 0.339 | 0.255 | 0.204 |
| 2.981371428256667 | 0.339 | 0.255 | 0.204 |
| 2.984513020910257 | 0.339 | 0.255 | 0.204 |
| 2.987654613563846 | 0.339 | 0.254 | 0.204 |
| 2.990796206217436 | 0.338 | 0.254 | 0.204 |
| 2.993937798871025 | 0.338 | 0.254 | 0.204 |
| 2.997079391524615 | 0.338 | 0.254 | 0.203 |
| 3.000220984178205 | 0.338 | 0.254 | 0.203 |
| 3.003362576831794 | 0.338 | 0.254 | 0.203 |
| 3.006504169485384 | 0.337 | 0.253 | 0.203 |
| 3.009645762138974 | 0.337 | 0.253 | 0.203 |
| 3.012787354792563 | 0.337 | 0.253 | 0.203 |
| 3.015928947446153 | 0.337 | 0.253 | 0.203 |
| 3.019070540099742 | 0.337 | 0.253 | 0.202 |
| 3.022212132753332 | 0.337 | 0.253 | 0.202 |
| 3.025353725406922 | 0.336 | 0.253 | 0.202 |
| 3.028495318060511 | 0.336 | 0.252 | 0.202 |
| 3.031636910714101 | 0.336 | 0.252 | 0.202 |
| 3.03477850336769 | 0.336 | 0.252 | 0.202 |
| 3.03792009602128 | 0.336 | 0.252 | 0.202 |
| 3.04106168867487 | 0.336 | 0.252 | 0.202 |
| 3.04420328132846 | 0.335 | 0.252 | 0.202 |
| 3.047344873982049 | 0.335 | 0.252 | 0.201 |
| 3.050486466635638 | 0.335 | 0.252 | 0.201 |
| 3.053628059289228 | 0.335 | 0.251 | 0.201 |
| 3.056769651942818 | 0.335 | 0.251 | 0.201 |
| 3.059911244596407 | 0.335 | 0.251 | 0.201 |
| 3.063052837249997 | 0.335 | 0.251 | 0.201 |
| 3.066194429903586 | 0.335 | 0.251 | 0.201 |
| 3.069336022557176 | 0.334 | 0.251 | 0.201 |
| 3.072477615210766 | 0.334 | 0.251 | 0.201 |
| 3.075619207864355 | 0.334 | 0.251 | 0.201 |
| 3.078760800517945 | 0.334 | 0.251 | 0.201 |
| 3.081902393171534 | 0.334 | 0.251 | 0.201 |
| 3.085043985825124 | 0.334 | 0.251 | 0.201 |
| 3.088185578478713 | 0.334 | 0.251 | 0.2 |
| 3.091327171132303 | 0.334 | 0.25 | 0.2 |
| 3.094468763785893 | 0.334 | 0.25 | 0.2 |
| 3.097610356439482 | 0.334 | 0.25 | 0.2 |
| 3.100751949093072 | 0.334 | 0.25 | 0.2 |
| 3.103893541746661 | 0.334 | 0.25 | 0.2 |
| 3.107035134400251 | 0.334 | 0.25 | 0.2 |
| 3.110176727053841 | 0.334 | 0.25 | 0.2 |
| 3.11331831970743 | 0.334 | 0.25 | 0.2 |
| 3.11645991236102 | 0.333 | 0.25 | 0.2 |
| 3.11960150501461 | 0.333 | 0.25 | 0.2 |
| 3.122743097668199 | 0.333 | 0.25 | 0.2 |
| 3.125884690321789 | 0.333 | 0.25 | 0.2 |
| 3.129026282975378 | 0.333 | 0.25 | 0.2 |
| 3.132167875628968 | 0.333 | 0.25 | 0.2 |
| 3.135309468282557 | 0.333 | 0.25 | 0.2 |
| 3.138451060936147 | 0.333 | 0.25 | 0.2 |
| 3.141592653589737 | 0.333 | 0.25 | 0.2 |
| 3.144734246243326 | 0.333 | 0.25 | 0.2 |
| 3.147875838896916 | 0.333 | 0.25 | 0.2 |
| 3.151017431550505 | 0.333 | 0.25 | 0.2 |
| 3.154159024204095 | 0.333 | 0.25 | 0.2 |
| 3.157300616857685 | 0.333 | 0.25 | 0.2 |
| 3.160442209511274 | 0.333 | 0.25 | 0.2 |
| 3.163583802164864 | 0.333 | 0.25 | 0.2 |
| 3.166725394818453 | 0.333 | 0.25 | 0.2 |
| 3.169866987472043 | 0.334 | 0.25 | 0.2 |
| 3.173008580125633 | 0.334 | 0.25 | 0.2 |
| 3.176150172779222 | 0.334 | 0.25 | 0.2 |
| 3.179291765432812 | 0.334 | 0.25 | 0.2 |
| 3.182433358086401 | 0.334 | 0.25 | 0.2 |
| 3.185574950739991 | 0.334 | 0.25 | 0.2 |
| 3.188716543393581 | 0.334 | 0.25 | 0.2 |
| 3.19185813604717 | 0.334 | 0.25 | 0.2 |
| 3.19499972870076 | 0.334 | 0.251 | 0.2 |
| 3.198141321354349 | 0.334 | 0.251 | 0.201 |
| 3.20128291400794 | 0.334 | 0.251 | 0.201 |
| 3.204424506661528 | 0.334 | 0.251 | 0.201 |
| 3.207566099315118 | 0.334 | 0.251 | 0.201 |
| 3.210707691968708 | 0.334 | 0.251 | 0.201 |
| 3.213849284622297 | 0.334 | 0.251 | 0.201 |
| 3.216990877275887 | 0.335 | 0.251 | 0.201 |
| 3.220132469929476 | 0.335 | 0.251 | 0.201 |
| 3.223274062583066 | 0.335 | 0.251 | 0.201 |
| 3.226415655236656 | 0.335 | 0.251 | 0.201 |
| 3.229557247890245 | 0.335 | 0.251 | 0.201 |
| 3.232698840543835 | 0.335 | 0.252 | 0.201 |
| 3.235840433197425 | 0.335 | 0.252 | 0.201 |
| 3.238982025851014 | 0.335 | 0.252 | 0.202 |
| 3.242123618504604 | 0.336 | 0.252 | 0.202 |
| 3.245265211158193 | 0.336 | 0.252 | 0.202 |
| 3.248406803811783 | 0.336 | 0.252 | 0.202 |
| 3.251548396465373 | 0.336 | 0.252 | 0.202 |
| 3.254689989118962 | 0.336 | 0.252 | 0.202 |
| 3.257831581772551 | 0.336 | 0.253 | 0.202 |
| 3.260973174426141 | 0.337 | 0.253 | 0.202 |
| 3.26411476707973 | 0.337 | 0.253 | 0.202 |
| 3.267256359733321 | 0.337 | 0.253 | 0.203 |
| 3.27039795238691 | 0.337 | 0.253 | 0.203 |
| 3.2735395450405 | 0.337 | 0.253 | 0.203 |
| 3.276681137694089 | 0.337 | 0.253 | 0.203 |
| 3.279822730347679 | 0.338 | 0.254 | 0.203 |
| 3.282964323001269 | 0.338 | 0.254 | 0.203 |
| 3.286105915654858 | 0.338 | 0.254 | 0.203 |
| 3.289247508308448 | 0.338 | 0.254 | 0.204 |
| 3.292389100962037 | 0.338 | 0.254 | 0.204 |
| 3.295530693615627 | 0.339 | 0.254 | 0.204 |
| 3.298672286269217 | 0.339 | 0.255 | 0.204 |
| 3.301813878922806 | 0.339 | 0.255 | 0.204 |
| 3.304955471576396 | 0.339 | 0.255 | 0.204 |
| 3.308097064229985 | 0.34 | 0.255 | 0.204 |
| 3.311238656883575 | 0.34 | 0.255 | 0.205 |
| 3.314380249537165 | 0.34 | 0.256 | 0.205 |
| 3.317521842190754 | 0.34 | 0.256 | 0.205 |
| 3.320663434844344 | 0.341 | 0.256 | 0.205 |
| 3.323805027497933 | 0.341 | 0.256 | 0.205 |
| 3.326946620151523 | 0.341 | 0.257 | 0.206 |
| 3.330088212805113 | 0.341 | 0.257 | 0.206 |
| 3.333229805458702 | 0.342 | 0.257 | 0.206 |
| 3.336371398112292 | 0.342 | 0.257 | 0.206 |
| 3.339512990765881 | 0.342 | 0.257 | 0.206 |
| 3.342654583419471 | 0.342 | 0.258 | 0.207 |
| 3.345796176073061 | 0.343 | 0.258 | 0.207 |
| 3.34893776872665 | 0.343 | 0.258 | 0.207 |
| 3.35207936138024 | 0.343 | 0.258 | 0.207 |
| 3.355220954033829 | 0.344 | 0.259 | 0.207 |
| 3.358362546687419 | 0.344 | 0.259 | 0.208 |
| 3.361504139341009 | 0.344 | 0.259 | 0.208 |
| 3.364645731994598 | 0.345 | 0.26 | 0.208 |
| 3.367787324648188 | 0.345 | 0.26 | 0.208 |
| 3.370928917301777 | 0.345 | 0.26 | 0.209 |
| 3.374070509955367 | 0.346 | 0.26 | 0.209 |
| 3.377212102608956 | 0.346 | 0.261 | 0.209 |
| 3.380353695262546 | 0.346 | 0.261 | 0.209 |
| 3.383495287916136 | 0.347 | 0.261 | 0.21 |
| 3.386636880569725 | 0.347 | 0.262 | 0.21 |
| 3.389778473223315 | 0.347 | 0.262 | 0.21 |
| 3.392920065876904 | 0.348 | 0.262 | 0.21 |
| 3.396061658530494 | 0.348 | 0.262 | 0.211 |
| 3.399203251184084 | 0.348 | 0.263 | 0.211 |
| 3.402344843837673 | 0.349 | 0.263 | 0.211 |
| 3.405486436491263 | 0.349 | 0.263 | 0.212 |
| 3.408628029144852 | 0.35 | 0.264 | 0.212 |
| 3.411769621798442 | 0.35 | 0.264 | 0.212 |
| 3.414911214452032 | 0.35 | 0.264 | 0.212 |
| 3.418052807105621 | 0.351 | 0.265 | 0.213 |
| 3.421194399759211 | 0.351 | 0.265 | 0.213 |
| 3.4243359924128 | 0.352 | 0.265 | 0.213 |
| 3.42747758506639 | 0.352 | 0.266 | 0.214 |
| 3.43061917771998 | 0.352 | 0.266 | 0.214 |
| 3.433760770373569 | 0.353 | 0.267 | 0.214 |
| 3.436902363027159 | 0.353 | 0.267 | 0.215 |
| 3.440043955680748 | 0.354 | 0.267 | 0.215 |
| 3.443185548334338 | 0.354 | 0.268 | 0.215 |
| 3.446327140987927 | 0.355 | 0.268 | 0.216 |
| 3.449468733641517 | 0.355 | 0.268 | 0.216 |
| 3.452610326295107 | 0.356 | 0.269 | 0.216 |
| 3.455751918948696 | 0.356 | 0.269 | 0.217 |
| 3.458893511602286 | 0.356 | 0.27 | 0.217 |
| 3.462035104255876 | 0.357 | 0.27 | 0.217 |
| 3.465176696909465 | 0.357 | 0.271 | 0.218 |
| 3.468318289563055 | 0.358 | 0.271 | 0.218 |
| 3.471459882216644 | 0.358 | 0.271 | 0.218 |
| 3.474601474870234 | 0.359 | 0.272 | 0.219 |
| 3.477743067523824 | 0.359 | 0.272 | 0.219 |
| 3.480884660177413 | 0.36 | 0.273 | 0.219 |
| 3.484026252831002 | 0.36 | 0.273 | 0.22 |
| 3.487167845484592 | 0.361 | 0.274 | 0.22 |
| 3.490309438138182 | 0.361 | 0.274 | 0.221 |
| 3.493451030791772 | 0.362 | 0.274 | 0.221 |
| 3.496592623445361 | 0.363 | 0.275 | 0.221 |
| 3.499734216098951 | 0.363 | 0.275 | 0.222 |
| 3.50287580875254 | 0.364 | 0.276 | 0.222 |
| 3.50601740140613 | 0.364 | 0.276 | 0.223 |
| 3.50915899405972 | 0.365 | 0.277 | 0.223 |
| 3.512300586713309 | 0.365 | 0.277 | 0.223 |
| 3.515442179366899 | 0.366 | 0.278 | 0.224 |
| 3.518583772020488 | 0.366 | 0.278 | 0.224 |
| 3.521725364674078 | 0.367 | 0.279 | 0.225 |
| 3.524866957327668 | 0.368 | 0.279 | 0.225 |
| 3.528008549981257 | 0.368 | 0.28 | 0.226 |
| 3.531150142634847 | 0.369 | 0.28 | 0.226 |
| 3.534291735288436 | 0.369 | 0.281 | 0.227 |
| 3.537433327942026 | 0.37 | 0.281 | 0.227 |
| 3.540574920595616 | 0.371 | 0.282 | 0.227 |
| 3.543716513249205 | 0.371 | 0.282 | 0.228 |
| 3.546858105902795 | 0.372 | 0.283 | 0.228 |
| 3.549999698556384 | 0.373 | 0.284 | 0.229 |
| 3.553141291209974 | 0.373 | 0.284 | 0.229 |
| 3.556282883863564 | 0.374 | 0.285 | 0.23 |
| 3.559424476517153 | 0.374 | 0.285 | 0.23 |
| 3.562566069170743 | 0.375 | 0.286 | 0.231 |
| 3.565707661824332 | 0.376 | 0.286 | 0.231 |
| 3.568849254477922 | 0.376 | 0.287 | 0.232 |
| 3.571990847131511 | 0.377 | 0.288 | 0.232 |
| 3.575132439785101 | 0.378 | 0.288 | 0.233 |
| 3.578274032438691 | 0.378 | 0.289 | 0.233 |
| 3.58141562509228 | 0.379 | 0.289 | 0.234 |
| 3.58455721774587 | 0.38 | 0.29 | 0.234 |
| 3.58769881039946 | 0.381 | 0.291 | 0.235 |
| 3.590840403053049 | 0.381 | 0.291 | 0.236 |
| 3.593981995706639 | 0.382 | 0.292 | 0.236 |
| 3.597123588360228 | 0.383 | 0.292 | 0.237 |
| 3.600265181013818 | 0.383 | 0.293 | 0.237 |
| 3.603406773667407 | 0.384 | 0.294 | 0.238 |
| 3.606548366320997 | 0.385 | 0.294 | 0.238 |
| 3.609689958974587 | 0.386 | 0.295 | 0.239 |
| 3.612831551628176 | 0.386 | 0.296 | 0.239 |
| 3.615973144281766 | 0.387 | 0.296 | 0.24 |
| 3.619114736935355 | 0.388 | 0.297 | 0.241 |
| 3.622256329588945 | 0.389 | 0.298 | 0.241 |
| 3.625397922242534 | 0.39 | 0.298 | 0.242 |
| 3.628539514896124 | 0.39 | 0.299 | 0.242 |
| 3.631681107549714 | 0.391 | 0.3 | 0.243 |
| 3.634822700203303 | 0.392 | 0.301 | 0.244 |
| 3.637964292856893 | 0.393 | 0.301 | 0.244 |
| 3.641105885510483 | 0.394 | 0.302 | 0.245 |
| 3.644247478164072 | 0.394 | 0.303 | 0.246 |
| 3.647389070817662 | 0.395 | 0.303 | 0.246 |
| 3.650530663471251 | 0.396 | 0.304 | 0.247 |
| 3.653672256124841 | 0.397 | 0.305 | 0.248 |
| 3.656813848778431 | 0.398 | 0.306 | 0.248 |
| 3.65995544143202 | 0.399 | 0.306 | 0.249 |
| 3.66309703408561 | 0.399 | 0.307 | 0.25 |
| 3.666238626739199 | 0.4 | 0.308 | 0.25 |
| 3.66938021939279 | 0.401 | 0.309 | 0.251 |
| 3.672521812046378 | 0.402 | 0.31 | 0.252 |
| 3.675663404699968 | 0.403 | 0.31 | 0.252 |
| 3.678804997353558 | 0.404 | 0.311 | 0.253 |
| 3.681946590007147 | 0.405 | 0.312 | 0.254 |
| 3.685088182660737 | 0.406 | 0.313 | 0.254 |
| 3.688229775314326 | 0.407 | 0.314 | 0.255 |
| 3.691371367967916 | 0.407 | 0.314 | 0.256 |
| 3.694512960621506 | 0.408 | 0.315 | 0.257 |
| 3.697654553275095 | 0.409 | 0.316 | 0.257 |
| 3.700796145928685 | 0.41 | 0.317 | 0.258 |
| 3.703937738582274 | 0.411 | 0.318 | 0.259 |
| 3.707079331235864 | 0.412 | 0.319 | 0.26 |
| 3.710220923889454 | 0.413 | 0.319 | 0.26 |
| 3.713362516543043 | 0.414 | 0.32 | 0.261 |
| 3.716504109196633 | 0.415 | 0.321 | 0.262 |
| 3.719645701850223 | 0.416 | 0.322 | 0.263 |
| 3.722787294503812 | 0.417 | 0.323 | 0.264 |
| 3.725928887157402 | 0.418 | 0.324 | 0.264 |
| 3.729070479810991 | 0.419 | 0.325 | 0.265 |
| 3.732212072464581 | 0.42 | 0.326 | 0.266 |
| 3.735353665118171 | 0.421 | 0.327 | 0.267 |
| 3.73849525777176 | 0.422 | 0.328 | 0.268 |
| 3.74163685042535 | 0.423 | 0.329 | 0.268 |
| 3.744778443078939 | 0.424 | 0.33 | 0.269 |
| 3.747920035732529 | 0.425 | 0.33 | 0.27 |
| 3.751061628386119 | 0.427 | 0.331 | 0.271 |
| 3.754203221039708 | 0.428 | 0.332 | 0.272 |
| 3.757344813693298 | 0.429 | 0.333 | 0.273 |
| 3.760486406346887 | 0.43 | 0.334 | 0.274 |
| 3.763627999000477 | 0.431 | 0.335 | 0.275 |
| 3.766769591654067 | 0.432 | 0.336 | 0.275 |
| 3.769911184307656 | 0.433 | 0.337 | 0.276 |
| 3.773052776961246 | 0.434 | 0.338 | 0.277 |
| 3.776194369614835 | 0.435 | 0.339 | 0.278 |
| 3.779335962268425 | 0.436 | 0.341 | 0.279 |
| 3.782477554922014 | 0.438 | 0.342 | 0.28 |
| 3.785619147575604 | 0.439 | 0.343 | 0.281 |
| 3.788760740229193 | 0.44 | 0.344 | 0.282 |
| 3.791902332882783 | 0.441 | 0.345 | 0.283 |
| 3.795043925536373 | 0.442 | 0.346 | 0.284 |
| 3.798185518189962 | 0.444 | 0.347 | 0.285 |
| 3.801327110843552 | 0.445 | 0.348 | 0.286 |
| 3.804468703497142 | 0.446 | 0.349 | 0.287 |
| 3.807610296150731 | 0.447 | 0.35 | 0.288 |
| 3.810751888804321 | 0.448 | 0.351 | 0.289 |
| 3.813893481457911 | 0.45 | 0.353 | 0.29 |
| 3.8170350741115 | 0.451 | 0.354 | 0.291 |
| 3.82017666676509 | 0.452 | 0.355 | 0.292 |
| 3.823318259418679 | 0.453 | 0.356 | 0.293 |
| 3.826459852072269 | 0.455 | 0.357 | 0.294 |
| 3.829601444725859 | 0.456 | 0.358 | 0.295 |
| 3.832743037379448 | 0.457 | 0.36 | 0.296 |
| 3.835884630033038 | 0.458 | 0.361 | 0.297 |
| 3.839026222686627 | 0.46 | 0.362 | 0.299 |
| 3.842167815340217 | 0.461 | 0.363 | 0.3 |
| 3.845309407993807 | 0.462 | 0.364 | 0.301 |
| 3.848451000647396 | 0.464 | 0.366 | 0.302 |
| 3.851592593300986 | 0.465 | 0.367 | 0.303 |
| 3.854734185954575 | 0.466 | 0.368 | 0.304 |
| 3.857875778608165 | 0.468 | 0.369 | 0.305 |
| 3.861017371261755 | 0.469 | 0.371 | 0.306 |
| 3.864158963915344 | 0.471 | 0.372 | 0.308 |
| 3.867300556568933 | 0.472 | 0.373 | 0.309 |
| 3.870442149222523 | 0.473 | 0.375 | 0.31 |
| 3.873583741876112 | 0.475 | 0.376 | 0.311 |
| 3.876725334529703 | 0.476 | 0.377 | 0.312 |
| 3.879866927183292 | 0.478 | 0.379 | 0.314 |
| 3.883008519836882 | 0.479 | 0.38 | 0.315 |
| 3.886150112490471 | 0.48 | 0.381 | 0.316 |
| 3.889291705144061 | 0.482 | 0.383 | 0.317 |
| 3.892433297797651 | 0.483 | 0.384 | 0.319 |
| 3.89557489045124 | 0.485 | 0.385 | 0.32 |
| 3.89871648310483 | 0.486 | 0.387 | 0.321 |
| 3.901858075758419 | 0.488 | 0.388 | 0.323 |
| 3.904999668412009 | 0.489 | 0.39 | 0.324 |
| 3.908141261065598 | 0.491 | 0.391 | 0.325 |
| 3.911282853719188 | 0.492 | 0.393 | 0.326 |
| 3.914424446372778 | 0.494 | 0.394 | 0.328 |
| 3.917566039026367 | 0.495 | 0.396 | 0.329 |
| 3.920707631679957 | 0.497 | 0.397 | 0.331 |
| 3.923849224333547 | 0.498 | 0.398 | 0.332 |
| 3.926990816987136 | 0.5 | 0.4 | 0.333 |
| 3.930132409640726 | 0.502 | 0.402 | 0.335 |
| 3.933274002294315 | 0.503 | 0.403 | 0.336 |
| 3.936415594947905 | 0.505 | 0.405 | 0.338 |
| 3.939557187601495 | 0.506 | 0.406 | 0.339 |
| 3.942698780255084 | 0.508 | 0.408 | 0.34 |
| 3.945840372908674 | 0.51 | 0.409 | 0.342 |
| 3.948981965562263 | 0.511 | 0.411 | 0.343 |
| 3.952123558215853 | 0.513 | 0.412 | 0.345 |
| 3.955265150869442 | 0.515 | 0.414 | 0.346 |
| 3.958406743523032 | 0.516 | 0.416 | 0.348 |
| 3.961548336176622 | 0.518 | 0.417 | 0.349 |
| 3.964689928830211 | 0.52 | 0.419 | 0.351 |
| 3.967831521483801 | 0.521 | 0.421 | 0.353 |
| 3.97097311413739 | 0.523 | 0.422 | 0.354 |
| 3.97411470679098 | 0.525 | 0.424 | 0.356 |
| 3.97725629944457 | 0.526 | 0.426 | 0.357 |
| 3.98039789209816 | 0.528 | 0.427 | 0.359 |
| 3.983539484751749 | 0.53 | 0.429 | 0.36 |
| 3.986681077405338 | 0.532 | 0.431 | 0.362 |
| 3.989822670058928 | 0.533 | 0.433 | 0.364 |
| 3.992964262712517 | 0.535 | 0.434 | 0.365 |
| 3.996105855366107 | 0.537 | 0.436 | 0.367 |
| 3.999247448019697 | 0.539 | 0.438 | 0.369 |
| 4.002389040673287 | 0.541 | 0.44 | 0.37 |
| 4.005530633326877 | 0.542 | 0.441 | 0.372 |
| 4.008672225980466 | 0.544 | 0.443 | 0.374 |
| 4.011813818634056 | 0.546 | 0.445 | 0.376 |
| 4.014955411287645 | 0.548 | 0.447 | 0.377 |
| 4.018097003941234 | 0.55 | 0.449 | 0.379 |
| 4.021238596594824 | 0.552 | 0.451 | 0.381 |
| 4.024380189248414 | 0.554 | 0.453 | 0.383 |
| 4.027521781902004 | 0.555 | 0.454 | 0.385 |
| 4.030663374555593 | 0.557 | 0.456 | 0.386 |
| 4.033804967209183 | 0.559 | 0.458 | 0.388 |
| 4.036946559862773 | 0.561 | 0.46 | 0.39 |
| 4.040088152516362 | 0.563 | 0.462 | 0.392 |
| 4.043229745169951 | 0.565 | 0.464 | 0.394 |
| 4.046371337823541 | 0.567 | 0.466 | 0.396 |
| 4.049512930477131 | 0.569 | 0.468 | 0.398 |
| 4.05265452313072 | 0.571 | 0.47 | 0.4 |
| 4.05579611578431 | 0.573 | 0.472 | 0.402 |
| 4.0589377084379 | 0.575 | 0.474 | 0.403 |
| 4.062079301091489 | 0.577 | 0.476 | 0.405 |
| 4.065220893745079 | 0.579 | 0.478 | 0.407 |
| 4.068362486398668 | 0.581 | 0.48 | 0.409 |
| 4.071504079052258 | 0.583 | 0.483 | 0.412 |
| 4.074645671705848 | 0.585 | 0.485 | 0.414 |
| 4.077787264359437 | 0.587 | 0.487 | 0.416 |
| 4.080928857013027 | 0.589 | 0.489 | 0.418 |
| 4.084070449666616 | 0.591 | 0.491 | 0.42 |
| 4.087212042320206 | 0.593 | 0.493 | 0.422 |
| 4.090353634973795 | 0.596 | 0.495 | 0.424 |
| 4.093495227627385 | 0.598 | 0.498 | 0.426 |
| 4.096636820280975 | 0.6 | 0.5 | 0.428 |
| 4.099778412934564 | 0.602 | 0.502 | 0.431 |
| 4.102920005588154 | 0.604 | 0.504 | 0.433 |
| 4.106061598241744 | 0.606 | 0.507 | 0.435 |
| 4.109203190895333 | 0.608 | 0.509 | 0.437 |
| 4.112344783548923 | 0.611 | 0.511 | 0.439 |
| 4.115486376202512 | 0.613 | 0.513 | 0.442 |
| 4.118627968856102 | 0.615 | 0.516 | 0.444 |
| 4.121769561509692 | 0.617 | 0.518 | 0.446 |
| 4.124911154163281 | 0.619 | 0.52 | 0.449 |
| 4.128052746816871 | 0.622 | 0.523 | 0.451 |
| 4.13119433947046 | 0.624 | 0.525 | 0.453 |
| 4.13433593212405 | 0.626 | 0.528 | 0.456 |
| 4.13747752477764 | 0.628 | 0.53 | 0.458 |
| 4.14061911743123 | 0.631 | 0.532 | 0.461 |
| 4.143760710084818 | 0.633 | 0.535 | 0.463 |
| 4.146902302738408 | 0.635 | 0.537 | 0.465 |
| 4.150043895391998 | 0.638 | 0.54 | 0.468 |
| 4.153185488045588 | 0.64 | 0.542 | 0.47 |
| 4.156327080699177 | 0.642 | 0.545 | 0.473 |
| 4.159468673352766 | 0.644 | 0.547 | 0.475 |
| 4.162610266006356 | 0.647 | 0.55 | 0.478 |
| 4.165751858659946 | 0.649 | 0.552 | 0.481 |
| 4.168893451313535 | 0.652 | 0.555 | 0.483 |
| 4.172035043967125 | 0.654 | 0.557 | 0.486 |
| 4.175176636620715 | 0.656 | 0.56 | 0.488 |
| 4.178318229274304 | 0.659 | 0.563 | 0.491 |
| 4.181459821927894 | 0.661 | 0.565 | 0.494 |
| 4.184601414581484 | 0.663 | 0.568 | 0.496 |
| 4.187743007235073 | 0.666 | 0.571 | 0.499 |
| 4.190884599888663 | 0.668 | 0.573 | 0.502 |
| 4.194026192542252 | 0.671 | 0.576 | 0.505 |
| 4.197167785195842 | 0.673 | 0.579 | 0.507 |
| 4.200309377849432 | 0.676 | 0.581 | 0.51 |
| 4.203450970503021 | 0.678 | 0.584 | 0.513 |
| 4.206592563156611 | 0.681 | 0.587 | 0.516 |
| 4.2097341558102 | 0.683 | 0.59 | 0.519 |
| 4.21287574846379 | 0.685 | 0.592 | 0.521 |
| 4.21601734111738 | 0.688 | 0.595 | 0.524 |
| 4.21915893377097 | 0.69 | 0.598 | 0.527 |
| 4.222300526424559 | 0.693 | 0.601 | 0.53 |
| 4.225442119078148 | 0.695 | 0.604 | 0.533 |
| 4.228583711731738 | 0.698 | 0.606 | 0.536 |
| 4.231725304385327 | 0.7 | 0.609 | 0.539 |
| 4.234866897038917 | 0.703 | 0.612 | 0.542 |
| 4.238008489692506 | 0.706 | 0.615 | 0.545 |
| 4.241150082346096 | 0.708 | 0.618 | 0.548 |
| 4.244291674999685 | 0.711 | 0.621 | 0.551 |
| 4.247433267653276 | 0.713 | 0.624 | 0.554 |
| 4.250574860306865 | 0.716 | 0.627 | 0.557 |
| 4.253716452960455 | 0.718 | 0.63 | 0.56 |
| 4.256858045614044 | 0.721 | 0.633 | 0.564 |
| 4.259999638267634 | 0.724 | 0.636 | 0.567 |
| 4.263141230921224 | 0.726 | 0.639 | 0.57 |
| 4.266282823574813 | 0.729 | 0.642 | 0.573 |
| 4.269424416228403 | 0.731 | 0.645 | 0.576 |
| 4.272566008881992 | 0.734 | 0.648 | 0.58 |
| 4.275707601535582 | 0.737 | 0.651 | 0.583 |
| 4.27884919418917 | 0.739 | 0.654 | 0.586 |
| 4.28199078684276 | 0.742 | 0.657 | 0.59 |
| 4.285132379496351 | 0.744 | 0.66 | 0.593 |
| 4.28827397214994 | 0.747 | 0.663 | 0.596 |
| 4.29141556480353 | 0.75 | 0.666 | 0.6 |
| 4.294557157457119 | 0.752 | 0.669 | 0.603 |
| 4.29769875011071 | 0.755 | 0.672 | 0.606 |
| 4.300840342764299 | 0.758 | 0.676 | 0.61 |
| 4.303981935417888 | 0.76 | 0.679 | 0.613 |
| 4.307123528071478 | 0.763 | 0.682 | 0.617 |
| 4.310265120725067 | 0.765 | 0.685 | 0.62 |
| 4.313406713378657 | 0.768 | 0.688 | 0.624 |
| 4.316548306032247 | 0.771 | 0.692 | 0.627 |
| 4.319689898685836 | 0.773 | 0.695 | 0.631 |
| 4.322831491339426 | 0.776 | 0.698 | 0.634 |
| 4.325973083993015 | 0.779 | 0.701 | 0.638 |
| 4.329114676646605 | 0.781 | 0.704 | 0.641 |
| 4.332256269300195 | 0.784 | 0.708 | 0.645 |
| 4.335397861953784 | 0.787 | 0.711 | 0.648 |
| 4.338539454607374 | 0.789 | 0.714 | 0.652 |
| 4.341681047260963 | 0.792 | 0.717 | 0.656 |
| 4.344822639914553 | 0.795 | 0.721 | 0.659 |
| 4.347964232568143 | 0.797 | 0.724 | 0.663 |
| 4.351105825221732 | 0.8 | 0.727 | 0.667 |
| 4.354247417875322 | 0.803 | 0.731 | 0.67 |
| 4.357389010528911 | 0.805 | 0.734 | 0.674 |
| 4.360530603182501 | 0.808 | 0.737 | 0.678 |
| 4.36367219583609 | 0.811 | 0.741 | 0.682 |
| 4.36681378848968 | 0.813 | 0.744 | 0.685 |
| 4.36995538114327 | 0.816 | 0.747 | 0.689 |
| 4.373096973796859 | 0.819 | 0.751 | 0.693 |
| 4.376238566450449 | 0.821 | 0.754 | 0.697 |
| 4.379380159104038 | 0.824 | 0.757 | 0.701 |
| 4.382521751757628 | 0.827 | 0.761 | 0.704 |
| 4.385663344411217 | 0.829 | 0.764 | 0.708 |
| 4.388804937064807 | 0.832 | 0.767 | 0.712 |
| 4.391946529718397 | 0.834 | 0.771 | 0.716 |
| 4.395088122371987 | 0.837 | 0.774 | 0.72 |
| 4.398229715025576 | 0.84 | 0.777 | 0.724 |
| 4.401371307679165 | 0.842 | 0.781 | 0.727 |
| 4.404512900332755 | 0.845 | 0.784 | 0.731 |
| 4.407654492986345 | 0.847 | 0.787 | 0.735 |
| 4.410796085639934 | 0.85 | 0.791 | 0.739 |
| 4.413937678293524 | 0.853 | 0.794 | 0.743 |
| 4.417079270947114 | 0.855 | 0.797 | 0.747 |
| 4.420220863600703 | 0.858 | 0.801 | 0.751 |
| 4.423362456254293 | 0.86 | 0.804 | 0.755 |
| 4.426504048907883 | 0.863 | 0.807 | 0.759 |
| 4.429645641561472 | 0.865 | 0.811 | 0.763 |
| 4.432787234215062 | 0.868 | 0.814 | 0.766 |
| 4.435928826868651 | 0.87 | 0.817 | 0.77 |
| 4.43907041952224 | 0.873 | 0.821 | 0.774 |
| 4.44221201217583 | 0.875 | 0.824 | 0.778 |
| 4.44535360482942 | 0.878 | 0.827 | 0.782 |
| 4.44849519748301 | 0.88 | 0.83 | 0.786 |
| 4.4516367901366 | 0.883 | 0.834 | 0.79 |
| 4.454778382790188 | 0.885 | 0.837 | 0.794 |
| 4.457919975443779 | 0.888 | 0.84 | 0.798 |
| 4.461061568097368 | 0.89 | 0.843 | 0.802 |
| 4.464203160750958 | 0.892 | 0.847 | 0.806 |
| 4.467344753404547 | 0.895 | 0.85 | 0.809 |
| 4.470486346058137 | 0.897 | 0.853 | 0.813 |
| 4.473627938711726 | 0.899 | 0.856 | 0.817 |
| 4.476769531365316 | 0.902 | 0.859 | 0.821 |
| 4.479911124018905 | 0.904 | 0.863 | 0.825 |
| 4.483052716672495 | 0.906 | 0.866 | 0.829 |
| 4.486194309326085 | 0.909 | 0.869 | 0.833 |
| 4.489335901979674 | 0.911 | 0.872 | 0.836 |
| 4.492477494633264 | 0.913 | 0.875 | 0.84 |
| 4.495619087286854 | 0.915 | 0.878 | 0.844 |
| 4.498760679940443 | 0.918 | 0.881 | 0.848 |
| 4.501902272594033 | 0.92 | 0.884 | 0.851 |
| 4.505043865247622 | 0.922 | 0.887 | 0.855 |
| 4.508185457901212 | 0.924 | 0.89 | 0.859 |
| 4.511327050554801 | 0.926 | 0.893 | 0.862 |
| 4.514468643208391 | 0.928 | 0.896 | 0.866 |
| 4.517610235861981 | 0.93 | 0.899 | 0.87 |
| 4.520751828515571 | 0.932 | 0.902 | 0.873 |
| 4.52389342116916 | 0.934 | 0.905 | 0.877 |
| 4.52703501382275 | 0.936 | 0.908 | 0.88 |
| 4.530176606476339 | 0.938 | 0.91 | 0.884 |
| 4.533318199129928 | 0.94 | 0.913 | 0.887 |
| 4.536459791783518 | 0.942 | 0.916 | 0.891 |
| 4.539601384437108 | 0.944 | 0.919 | 0.894 |
| 4.542742977090698 | 0.946 | 0.921 | 0.898 |
| 4.545884569744287 | 0.948 | 0.924 | 0.901 |
| 4.549026162397876 | 0.95 | 0.926 | 0.904 |
| 4.552167755051466 | 0.952 | 0.929 | 0.908 |
| 4.555309347705056 | 0.953 | 0.932 | 0.911 |
| 4.558450940358646 | 0.955 | 0.934 | 0.914 |
| 4.561592533012235 | 0.957 | 0.937 | 0.917 |
| 4.564734125665825 | 0.959 | 0.939 | 0.92 |
| 4.567875718319415 | 0.96 | 0.941 | 0.923 |
| 4.571017310973004 | 0.962 | 0.944 | 0.926 |
| 4.574158903626594 | 0.963 | 0.946 | 0.929 |
| 4.577300496280183 | 0.965 | 0.948 | 0.932 |
| 4.580442088933772 | 0.967 | 0.951 | 0.935 |
| 4.583583681587362 | 0.968 | 0.953 | 0.938 |
| 4.586725274240952 | 0.97 | 0.955 | 0.941 |
| 4.589866866894542 | 0.971 | 0.957 | 0.944 |
| 4.593008459548131 | 0.972 | 0.959 | 0.946 |
| 4.596150052201721 | 0.974 | 0.961 | 0.949 |
| 4.59929164485531 | 0.975 | 0.963 | 0.952 |
| 4.6024332375089 | 0.976 | 0.965 | 0.954 |
| 4.60557483016249 | 0.978 | 0.967 | 0.957 |
| 4.608716422816079 | 0.979 | 0.969 | 0.959 |
| 4.611858015469668 | 0.98 | 0.971 | 0.961 |
| 4.614999608123258 | 0.981 | 0.972 | 0.964 |
| 4.618141200776848 | 0.983 | 0.974 | 0.966 |
| 4.621282793430437 | 0.984 | 0.976 | 0.968 |
| 4.624424386084027 | 0.985 | 0.977 | 0.97 |
| 4.627565978737617 | 0.986 | 0.979 | 0.972 |
| 4.630707571391206 | 0.987 | 0.98 | 0.974 |
| 4.633849164044795 | 0.988 | 0.982 | 0.976 |
| 4.636990756698386 | 0.989 | 0.983 | 0.978 |
| 4.640132349351975 | 0.99 | 0.985 | 0.98 |
| 4.643273942005564 | 0.991 | 0.986 | 0.981 |
| 4.646415534659154 | 0.991 | 0.987 | 0.983 |
| 4.649557127312744 | 0.992 | 0.988 | 0.984 |
| 4.652698719966334 | 0.993 | 0.989 | 0.986 |
| 4.655840312619923 | 0.994 | 0.991 | 0.987 |
| 4.658981905273513 | 0.994 | 0.992 | 0.989 |
| 4.662123497927102 | 0.995 | 0.992 | 0.99 |
| 4.665265090580692 | 0.996 | 0.993 | 0.991 |
| 4.668406683234282 | 0.996 | 0.994 | 0.992 |
| 4.671548275887871 | 0.997 | 0.995 | 0.993 |
| 4.674689868541461 | 0.997 | 0.996 | 0.994 |
| 4.67783146119505 | 0.998 | 0.996 | 0.995 |
| 4.68097305384864 | 0.998 | 0.997 | 0.996 |
| 4.68411464650223 | 0.998 | 0.998 | 0.997 |
| 4.687256239155819 | 0.999 | 0.998 | 0.997 |
| 4.690397831809409 | 0.999 | 0.999 | 0.998 |
| 4.693539424462998 | 0.999 | 0.999 | 0.999 |
| 4.696681017116588 | 1 | 0.999 | 0.999 |
| 4.699822609770177 | 1 | 1 | 0.999 |
| 4.702964202423767 | 1 | 1 | 1 |
| 4.706105795077356 | 1 | 1 | 1 |
| 4.709247387730946 | 1 | 1 | 1 |
| 4.712388980384535 | 1 | 1 | 1 |
| 4.715530573038126 | 1 | 1 | 1 |
| 4.718672165691715 | 1 | 1 | 1 |
| 4.721813758345305 | 1 | 1 | 1 |
| 4.724955350998894 | 1 | 1 | 0.999 |
| 4.728096943652484 | 1 | 0.999 | 0.999 |
| 4.731238536306074 | 0.999 | 0.999 | 0.999 |
| 4.734380128959663 | 0.999 | 0.999 | 0.998 |
| 4.737521721613253 | 0.999 | 0.998 | 0.997 |
| 4.740663314266842 | 0.998 | 0.998 | 0.997 |
| 4.743804906920432 | 0.998 | 0.997 | 0.996 |
| 4.74694649957402 | 0.998 | 0.996 | 0.995 |
| 4.750088092227611 | 0.997 | 0.996 | 0.994 |
| 4.7532296848812 | 0.997 | 0.995 | 0.993 |
| 4.75637127753479 | 0.996 | 0.994 | 0.992 |
| 4.75951287018838 | 0.996 | 0.993 | 0.991 |
| 4.76265446284197 | 0.995 | 0.992 | 0.99 |
| 4.765796055495559 | 0.994 | 0.992 | 0.989 |
| 4.768937648149149 | 0.994 | 0.991 | 0.987 |
| 4.772079240802738 | 0.993 | 0.989 | 0.986 |
| 4.775220833456327 | 0.992 | 0.988 | 0.984 |
| 4.778362426109917 | 0.991 | 0.987 | 0.983 |
| 4.781504018763507 | 0.991 | 0.986 | 0.981 |
| 4.784645611417097 | 0.99 | 0.985 | 0.98 |
| 4.787787204070686 | 0.989 | 0.983 | 0.978 |
| 4.790928796724275 | 0.988 | 0.982 | 0.976 |
| 4.794070389377865 | 0.987 | 0.98 | 0.974 |
| 4.797211982031455 | 0.986 | 0.979 | 0.972 |
| 4.800353574685045 | 0.985 | 0.977 | 0.97 |
| 4.803495167338634 | 0.984 | 0.976 | 0.968 |
| 4.806636759992224 | 0.983 | 0.974 | 0.966 |
| 4.809778352645814 | 0.981 | 0.972 | 0.964 |
| 4.812919945299403 | 0.98 | 0.971 | 0.961 |
| 4.816061537952993 | 0.979 | 0.969 | 0.959 |
| 4.819203130606582 | 0.978 | 0.967 | 0.957 |
| 4.822344723260172 | 0.976 | 0.965 | 0.954 |
| 4.825486315913761 | 0.975 | 0.963 | 0.952 |
| 4.828627908567351 | 0.974 | 0.961 | 0.949 |
| 4.83176950122094 | 0.972 | 0.959 | 0.946 |
| 4.83491109387453 | 0.971 | 0.957 | 0.944 |
| 4.83805268652812 | 0.97 | 0.955 | 0.941 |
| 4.841194279181709 | 0.968 | 0.953 | 0.938 |
| 4.844335871835299 | 0.967 | 0.951 | 0.935 |
| 4.847477464488889 | 0.965 | 0.948 | 0.932 |
| 4.850619057142478 | 0.963 | 0.946 | 0.929 |
| 4.853760649796068 | 0.962 | 0.944 | 0.926 |
| 4.856902242449657 | 0.96 | 0.941 | 0.923 |
| 4.860043835103247 | 0.959 | 0.939 | 0.92 |
| 4.863185427756837 | 0.957 | 0.937 | 0.917 |
| 4.866327020410426 | 0.955 | 0.934 | 0.914 |
| 4.869468613064015 | 0.953 | 0.932 | 0.911 |
| 4.872610205717605 | 0.952 | 0.929 | 0.908 |
| 4.875751798371195 | 0.95 | 0.926 | 0.904 |
| 4.878893391024784 | 0.948 | 0.924 | 0.901 |
| 4.882034983678374 | 0.946 | 0.921 | 0.898 |
| 4.885176576331964 | 0.944 | 0.919 | 0.894 |
| 4.888318168985553 | 0.942 | 0.916 | 0.891 |
| 4.891459761639143 | 0.94 | 0.913 | 0.887 |
| 4.894601354292733 | 0.938 | 0.91 | 0.884 |
| 4.897742946946322 | 0.936 | 0.908 | 0.88 |
| 4.900884539599912 | 0.934 | 0.905 | 0.877 |
| 4.904026132253501 | 0.932 | 0.902 | 0.873 |
| 4.907167724907091 | 0.93 | 0.899 | 0.87 |
| 4.91030931756068 | 0.928 | 0.896 | 0.866 |
| 4.91345091021427 | 0.926 | 0.893 | 0.862 |
| 4.91659250286786 | 0.924 | 0.89 | 0.859 |
| 4.91973409552145 | 0.922 | 0.887 | 0.855 |
| 4.922875688175039 | 0.92 | 0.884 | 0.851 |
| 4.926017280828628 | 0.918 | 0.881 | 0.848 |
| 4.929158873482218 | 0.915 | 0.878 | 0.844 |
| 4.932300466135808 | 0.913 | 0.875 | 0.84 |
| 4.935442058789397 | 0.911 | 0.872 | 0.836 |
| 4.938583651442987 | 0.909 | 0.869 | 0.833 |
| 4.941725244096576 | 0.906 | 0.866 | 0.829 |
| 4.944866836750166 | 0.904 | 0.863 | 0.825 |
| 4.948008429403755 | 0.902 | 0.859 | 0.821 |
| 4.951150022057345 | 0.899 | 0.856 | 0.817 |
| 4.954291614710935 | 0.897 | 0.853 | 0.813 |
| 4.957433207364524 | 0.895 | 0.85 | 0.809 |
| 4.960574800018114 | 0.892 | 0.847 | 0.806 |
| 4.963716392671704 | 0.89 | 0.843 | 0.802 |
| 4.966857985325293 | 0.888 | 0.84 | 0.798 |
| 4.969999577978883 | 0.885 | 0.837 | 0.794 |
| 4.973141170632472 | 0.883 | 0.834 | 0.79 |
| 4.976282763286062 | 0.88 | 0.83 | 0.786 |
| 4.979424355939651 | 0.878 | 0.827 | 0.782 |
| 4.982565948593241 | 0.875 | 0.824 | 0.778 |
| 4.985707541246831 | 0.873 | 0.821 | 0.774 |
| 4.98884913390042 | 0.87 | 0.817 | 0.77 |
| 4.99199072655401 | 0.868 | 0.814 | 0.766 |
| 4.9951323192076 | 0.865 | 0.811 | 0.763 |
| 4.99827391186119 | 0.863 | 0.807 | 0.759 |
| 5.00141550451478 | 0.86 | 0.804 | 0.755 |
| 5.004557097168369 | 0.858 | 0.801 | 0.751 |
| 5.007698689821958 | 0.855 | 0.797 | 0.747 |
| 5.010840282475548 | 0.853 | 0.794 | 0.743 |
| 5.013981875129137 | 0.85 | 0.791 | 0.739 |
| 5.017123467782727 | 0.847 | 0.787 | 0.735 |
| 5.020265060436317 | 0.845 | 0.784 | 0.731 |
| 5.023406653089906 | 0.842 | 0.781 | 0.727 |
| 5.026548245743496 | 0.84 | 0.777 | 0.724 |
| 5.029689838397085 | 0.837 | 0.774 | 0.72 |
| 5.032831431050674 | 0.834 | 0.771 | 0.716 |
| 5.035973023704264 | 0.832 | 0.767 | 0.712 |
| 5.039114616357854 | 0.829 | 0.764 | 0.708 |
| 5.042256209011444 | 0.827 | 0.761 | 0.704 |
| 5.045397801665033 | 0.824 | 0.757 | 0.701 |
| 5.048539394318622 | 0.821 | 0.754 | 0.697 |
| 5.051680986972213 | 0.819 | 0.751 | 0.693 |
| 5.054822579625802 | 0.816 | 0.747 | 0.689 |
| 5.057964172279392 | 0.813 | 0.744 | 0.685 |
| 5.061105764932981 | 0.811 | 0.741 | 0.682 |
| 5.064247357586571 | 0.808 | 0.737 | 0.678 |
| 5.067388950240161 | 0.805 | 0.734 | 0.674 |
| 5.07053054289375 | 0.803 | 0.731 | 0.67 |
| 5.07367213554734 | 0.8 | 0.727 | 0.667 |
| 5.07681372820093 | 0.797 | 0.724 | 0.663 |
| 5.079955320854519 | 0.795 | 0.721 | 0.659 |
| 5.083096913508108 | 0.792 | 0.717 | 0.656 |
| 5.086238506161698 | 0.789 | 0.714 | 0.652 |
| 5.089380098815288 | 0.787 | 0.711 | 0.648 |
| 5.092521691468877 | 0.784 | 0.708 | 0.645 |
| 5.095663284122466 | 0.781 | 0.704 | 0.641 |
| 5.098804876776057 | 0.779 | 0.701 | 0.638 |
| 5.101946469429646 | 0.776 | 0.698 | 0.634 |
| 5.105088062083236 | 0.773 | 0.695 | 0.631 |
| 5.108229654736825 | 0.771 | 0.692 | 0.627 |
| 5.111371247390415 | 0.768 | 0.688 | 0.624 |
| 5.114512840044005 | 0.765 | 0.685 | 0.62 |
| 5.117654432697594 | 0.763 | 0.682 | 0.617 |
| 5.120796025351184 | 0.76 | 0.679 | 0.613 |
| 5.123937618004773 | 0.758 | 0.676 | 0.61 |
| 5.127079210658363 | 0.755 | 0.672 | 0.606 |
| 5.130220803311953 | 0.752 | 0.669 | 0.603 |
| 5.133362395965542 | 0.75 | 0.666 | 0.6 |
| 5.136503988619131 | 0.747 | 0.663 | 0.596 |
| 5.13964558127272 | 0.744 | 0.66 | 0.593 |
| 5.142787173926311 | 0.742 | 0.657 | 0.59 |
| 5.1459287665799 | 0.739 | 0.654 | 0.586 |
| 5.14907035923349 | 0.737 | 0.651 | 0.583 |
| 5.15221195188708 | 0.734 | 0.648 | 0.58 |
| 5.15535354454067 | 0.731 | 0.645 | 0.576 |
| 5.158495137194259 | 0.729 | 0.642 | 0.573 |
| 5.161636729847848 | 0.726 | 0.639 | 0.57 |
| 5.164778322501438 | 0.724 | 0.636 | 0.567 |
| 5.167919915155028 | 0.721 | 0.633 | 0.564 |
| 5.171061507808617 | 0.718 | 0.63 | 0.56 |
| 5.174203100462206 | 0.716 | 0.627 | 0.557 |
| 5.177344693115796 | 0.713 | 0.624 | 0.554 |
| 5.180486285769386 | 0.711 | 0.621 | 0.551 |
| 5.183627878422976 | 0.708 | 0.618 | 0.548 |
| 5.186769471076565 | 0.706 | 0.615 | 0.545 |
| 5.189911063730155 | 0.703 | 0.612 | 0.542 |
| 5.193052656383744 | 0.7 | 0.609 | 0.539 |
| 5.196194249037334 | 0.698 | 0.606 | 0.536 |
| 5.199335841690924 | 0.695 | 0.604 | 0.533 |
| 5.202477434344513 | 0.693 | 0.601 | 0.53 |
| 5.205619026998103 | 0.69 | 0.598 | 0.527 |
| 5.208760619651692 | 0.688 | 0.595 | 0.524 |
| 5.211902212305282 | 0.685 | 0.592 | 0.521 |
| 5.215043804958871 | 0.683 | 0.59 | 0.519 |
| 5.218185397612461 | 0.681 | 0.587 | 0.516 |
| 5.221326990266051 | 0.678 | 0.584 | 0.513 |
| 5.22446858291964 | 0.676 | 0.581 | 0.51 |
| 5.22761017557323 | 0.673 | 0.579 | 0.507 |
| 5.23075176822682 | 0.671 | 0.576 | 0.505 |
| 5.23389336088041 | 0.668 | 0.573 | 0.502 |
| 5.237034953533999 | 0.666 | 0.571 | 0.499 |
| 5.240176546187588 | 0.663 | 0.568 | 0.496 |
| 5.243318138841178 | 0.661 | 0.565 | 0.494 |
| 5.246459731494767 | 0.659 | 0.563 | 0.491 |
| 5.249601324148357 | 0.656 | 0.56 | 0.488 |
| 5.252742916801947 | 0.654 | 0.557 | 0.486 |
| 5.255884509455536 | 0.652 | 0.555 | 0.483 |
| 5.259026102109125 | 0.649 | 0.552 | 0.481 |
| 5.262167694762715 | 0.647 | 0.55 | 0.478 |
| 5.265309287416305 | 0.644 | 0.547 | 0.475 |
| 5.268450880069895 | 0.642 | 0.545 | 0.473 |
| 5.271592472723484 | 0.64 | 0.542 | 0.47 |
| 5.274734065377074 | 0.638 | 0.54 | 0.468 |
| 5.277875658030664 | 0.635 | 0.537 | 0.465 |
| 5.281017250684253 | 0.633 | 0.535 | 0.463 |
| 5.284158843337843 | 0.631 | 0.532 | 0.461 |
| 5.287300435991432 | 0.628 | 0.53 | 0.458 |
| 5.290442028645022 | 0.626 | 0.528 | 0.456 |
| 5.293583621298612 | 0.624 | 0.525 | 0.453 |
| 5.296725213952201 | 0.622 | 0.523 | 0.451 |
| 5.299866806605791 | 0.619 | 0.52 | 0.449 |
| 5.30300839925938 | 0.617 | 0.518 | 0.446 |
| 5.30614999191297 | 0.615 | 0.516 | 0.444 |
| 5.30929158456656 | 0.613 | 0.513 | 0.442 |
| 5.312433177220149 | 0.611 | 0.511 | 0.439 |
| 5.315574769873739 | 0.608 | 0.509 | 0.437 |
| 5.318716362527328 | 0.606 | 0.507 | 0.435 |
| 5.321857955180918 | 0.604 | 0.504 | 0.433 |
| 5.324999547834508 | 0.602 | 0.502 | 0.431 |
| 5.328141140488097 | 0.6 | 0.5 | 0.428 |
| 5.331282733141686 | 0.598 | 0.498 | 0.426 |
| 5.334424325795276 | 0.596 | 0.495 | 0.424 |
| 5.337565918448866 | 0.593 | 0.493 | 0.422 |
| 5.340707511102456 | 0.591 | 0.491 | 0.42 |
| 5.343849103756045 | 0.589 | 0.489 | 0.418 |
| 5.346990696409634 | 0.587 | 0.487 | 0.416 |
| 5.350132289063224 | 0.585 | 0.485 | 0.414 |
| 5.353273881716814 | 0.583 | 0.483 | 0.412 |
| 5.356415474370403 | 0.581 | 0.48 | 0.409 |
| 5.359557067023993 | 0.579 | 0.478 | 0.407 |
| 5.362698659677583 | 0.577 | 0.476 | 0.405 |
| 5.365840252331172 | 0.575 | 0.474 | 0.403 |
| 5.368981844984762 | 0.573 | 0.472 | 0.402 |
| 5.372123437638351 | 0.571 | 0.47 | 0.4 |
| 5.375265030291941 | 0.569 | 0.468 | 0.398 |
| 5.378406622945531 | 0.567 | 0.466 | 0.396 |
| 5.38154821559912 | 0.565 | 0.464 | 0.394 |
| 5.38468980825271 | 0.563 | 0.462 | 0.392 |
| 5.387831400906299 | 0.561 | 0.46 | 0.39 |
| 5.39097299355989 | 0.559 | 0.458 | 0.388 |
| 5.394114586213479 | 0.557 | 0.456 | 0.386 |
| 5.397256178867068 | 0.555 | 0.454 | 0.385 |
| 5.400397771520657 | 0.554 | 0.453 | 0.383 |
| 5.403539364174247 | 0.552 | 0.451 | 0.381 |
| 5.406680956827837 | 0.55 | 0.449 | 0.379 |
| 5.409822549481426 | 0.548 | 0.447 | 0.377 |
| 5.412964142135016 | 0.546 | 0.445 | 0.376 |
| 5.416105734788605 | 0.544 | 0.443 | 0.374 |
| 5.419247327442195 | 0.542 | 0.441 | 0.372 |
| 5.422388920095785 | 0.541 | 0.44 | 0.37 |
| 5.425530512749375 | 0.539 | 0.438 | 0.369 |
| 5.428672105402964 | 0.537 | 0.436 | 0.367 |
| 5.431813698056554 | 0.535 | 0.434 | 0.365 |
| 5.434955290710143 | 0.533 | 0.433 | 0.364 |
| 5.438096883363733 | 0.532 | 0.431 | 0.362 |
| 5.441238476017322 | 0.53 | 0.429 | 0.36 |
| 5.444380068670912 | 0.528 | 0.427 | 0.359 |
| 5.447521661324502 | 0.526 | 0.426 | 0.357 |
| 5.450663253978091 | 0.525 | 0.424 | 0.356 |
| 5.453804846631681 | 0.523 | 0.422 | 0.354 |
| 5.456946439285271 | 0.521 | 0.421 | 0.353 |
| 5.46008803193886 | 0.52 | 0.419 | 0.351 |
| 5.46322962459245 | 0.518 | 0.417 | 0.349 |
| 5.466371217246039 | 0.516 | 0.416 | 0.348 |
| 5.46951280989963 | 0.515 | 0.414 | 0.346 |
| 5.472654402553218 | 0.513 | 0.412 | 0.345 |
| 5.475795995206808 | 0.511 | 0.411 | 0.343 |
| 5.478937587860398 | 0.51 | 0.409 | 0.342 |
| 5.482079180513987 | 0.508 | 0.408 | 0.34 |
| 5.485220773167577 | 0.506 | 0.406 | 0.339 |
| 5.488362365821166 | 0.505 | 0.405 | 0.338 |
| 5.491503958474756 | 0.503 | 0.403 | 0.336 |
| 5.494645551128346 | 0.502 | 0.402 | 0.335 |
| 5.497787143781935 | 0.5 | 0.4 | 0.333 |
| 5.500928736435525 | 0.498 | 0.398 | 0.332 |
| 5.504070329089115 | 0.497 | 0.397 | 0.331 |
| 5.507211921742704 | 0.495 | 0.396 | 0.329 |
| 5.510353514396294 | 0.494 | 0.394 | 0.328 |
| 5.513495107049883 | 0.492 | 0.393 | 0.326 |
| 5.516636699703473 | 0.491 | 0.391 | 0.325 |
| 5.519778292357062 | 0.489 | 0.39 | 0.324 |
| 5.522919885010652 | 0.488 | 0.388 | 0.323 |
| 5.526061477664242 | 0.486 | 0.387 | 0.321 |
| 5.529203070317831 | 0.485 | 0.385 | 0.32 |
| 5.532344662971421 | 0.483 | 0.384 | 0.319 |
| 5.535486255625011 | 0.482 | 0.383 | 0.317 |
| 5.5386278482786 | 0.48 | 0.381 | 0.316 |
| 5.54176944093219 | 0.479 | 0.38 | 0.315 |
| 5.544911033585779 | 0.478 | 0.379 | 0.314 |
| 5.54805262623937 | 0.476 | 0.377 | 0.312 |
| 5.551194218892959 | 0.475 | 0.376 | 0.311 |
| 5.554335811546548 | 0.473 | 0.375 | 0.31 |
| 5.557477404200137 | 0.472 | 0.373 | 0.309 |
| 5.560618996853727 | 0.471 | 0.372 | 0.308 |
| 5.563760589507317 | 0.469 | 0.371 | 0.306 |
| 5.566902182160906 | 0.468 | 0.369 | 0.305 |
| 5.570043774814496 | 0.466 | 0.368 | 0.304 |
| 5.573185367468086 | 0.465 | 0.367 | 0.303 |
| 5.576326960121675 | 0.464 | 0.366 | 0.302 |
| 5.579468552775264 | 0.462 | 0.364 | 0.301 |
| 5.582610145428854 | 0.461 | 0.363 | 0.3 |
| 5.585751738082444 | 0.46 | 0.362 | 0.299 |
| 5.588893330736034 | 0.458 | 0.361 | 0.297 |
| 5.592034923389623 | 0.457 | 0.36 | 0.296 |
| 5.595176516043213 | 0.456 | 0.358 | 0.295 |
| 5.598318108696803 | 0.455 | 0.357 | 0.294 |
| 5.601459701350392 | 0.453 | 0.356 | 0.293 |
| 5.604601294003982 | 0.452 | 0.355 | 0.292 |
| 5.607742886657571 | 0.451 | 0.354 | 0.291 |
| 5.610884479311161 | 0.45 | 0.353 | 0.29 |
| 5.61402607196475 | 0.448 | 0.351 | 0.289 |
| 5.61716766461834 | 0.447 | 0.35 | 0.288 |
| 5.62030925727193 | 0.446 | 0.349 | 0.287 |
| 5.623450849925519 | 0.445 | 0.348 | 0.286 |
| 5.626592442579109 | 0.444 | 0.347 | 0.285 |
| 5.629734035232698 | 0.442 | 0.346 | 0.284 |
| 5.632875627886288 | 0.441 | 0.345 | 0.283 |
| 5.636017220539878 | 0.44 | 0.344 | 0.282 |
| 5.639158813193467 | 0.439 | 0.343 | 0.281 |
| 5.642300405847057 | 0.438 | 0.342 | 0.28 |
| 5.645441998500646 | 0.436 | 0.341 | 0.279 |
| 5.648583591154236 | 0.435 | 0.339 | 0.278 |
| 5.651725183807825 | 0.434 | 0.338 | 0.277 |
| 5.654866776461415 | 0.433 | 0.337 | 0.276 |
| 5.658008369115005 | 0.432 | 0.336 | 0.275 |
| 5.661149961768594 | 0.431 | 0.335 | 0.275 |
| 5.664291554422184 | 0.43 | 0.334 | 0.274 |
| 5.667433147075774 | 0.429 | 0.333 | 0.273 |
| 5.670574739729363 | 0.428 | 0.332 | 0.272 |
| 5.673716332382953 | 0.427 | 0.331 | 0.271 |
| 5.676857925036542 | 0.425 | 0.33 | 0.27 |
| 5.679999517690132 | 0.424 | 0.33 | 0.269 |
| 5.683141110343721 | 0.423 | 0.329 | 0.268 |
| 5.686282702997311 | 0.422 | 0.328 | 0.268 |
| 5.689424295650901 | 0.421 | 0.327 | 0.267 |
| 5.69256588830449 | 0.42 | 0.326 | 0.266 |
| 5.69570748095808 | 0.419 | 0.325 | 0.265 |
| 5.69884907361167 | 0.418 | 0.324 | 0.264 |
| 5.701990666265259 | 0.417 | 0.323 | 0.264 |
| 5.705132258918849 | 0.416 | 0.322 | 0.263 |
| 5.708273851572438 | 0.415 | 0.321 | 0.262 |
| 5.711415444226028 | 0.414 | 0.32 | 0.261 |
| 5.714557036879618 | 0.413 | 0.319 | 0.26 |
| 5.717698629533207 | 0.412 | 0.319 | 0.26 |
| 5.720840222186797 | 0.411 | 0.318 | 0.259 |
| 5.723981814840386 | 0.41 | 0.317 | 0.258 |
| 5.727123407493976 | 0.409 | 0.316 | 0.257 |
| 5.730265000147565 | 0.408 | 0.315 | 0.257 |
| 5.733406592801155 | 0.407 | 0.314 | 0.256 |
| 5.736548185454744 | 0.407 | 0.314 | 0.255 |
| 5.739689778108334 | 0.406 | 0.313 | 0.254 |
| 5.742831370761924 | 0.405 | 0.312 | 0.254 |
| 5.745972963415514 | 0.404 | 0.311 | 0.253 |
| 5.749114556069103 | 0.403 | 0.31 | 0.252 |
| 5.752256148722693 | 0.402 | 0.31 | 0.252 |
| 5.755397741376282 | 0.401 | 0.309 | 0.251 |
| 5.758539334029872 | 0.4 | 0.308 | 0.25 |
| 5.761680926683462 | 0.399 | 0.307 | 0.25 |
| 5.764822519337051 | 0.399 | 0.306 | 0.249 |
| 5.767964111990641 | 0.398 | 0.306 | 0.248 |
| 5.77110570464423 | 0.397 | 0.305 | 0.248 |
| 5.77424729729782 | 0.396 | 0.304 | 0.247 |
| 5.77738888995141 | 0.395 | 0.303 | 0.246 |
| 5.780530482605 | 0.394 | 0.303 | 0.246 |
| 5.783672075258588 | 0.394 | 0.302 | 0.245 |
| 5.786813667912178 | 0.393 | 0.301 | 0.244 |
| 5.789955260565768 | 0.392 | 0.301 | 0.244 |
| 5.793096853219358 | 0.391 | 0.3 | 0.243 |
| 5.796238445872947 | 0.39 | 0.299 | 0.242 |
| 5.799380038526537 | 0.39 | 0.298 | 0.242 |
| 5.802521631180126 | 0.389 | 0.298 | 0.241 |
| 5.805663223833715 | 0.388 | 0.297 | 0.241 |
| 5.808804816487306 | 0.387 | 0.296 | 0.24 |
| 5.811946409140895 | 0.386 | 0.296 | 0.239 |
| 5.815088001794485 | 0.386 | 0.295 | 0.239 |
| 5.818229594448074 | 0.385 | 0.294 | 0.238 |
| 5.821371187101663 | 0.384 | 0.294 | 0.238 |
| 5.824512779755254 | 0.383 | 0.293 | 0.237 |
| 5.827654372408843 | 0.383 | 0.292 | 0.237 |
| 5.830795965062433 | 0.382 | 0.292 | 0.236 |
| 5.833937557716022 | 0.381 | 0.291 | 0.236 |
| 5.837079150369612 | 0.381 | 0.291 | 0.235 |
| 5.840220743023201 | 0.38 | 0.29 | 0.234 |
| 5.843362335676791 | 0.379 | 0.289 | 0.234 |
| 5.846503928330381 | 0.378 | 0.289 | 0.233 |
| 5.84964552098397 | 0.378 | 0.288 | 0.233 |
| 5.85278711363756 | 0.377 | 0.288 | 0.232 |
| 5.85592870629115 | 0.376 | 0.287 | 0.232 |
| 5.85907029894474 | 0.376 | 0.286 | 0.231 |
| 5.862211891598329 | 0.375 | 0.286 | 0.231 |
| 5.865353484251918 | 0.374 | 0.285 | 0.23 |
| 5.868495076905508 | 0.374 | 0.285 | 0.23 |
| 5.871636669559098 | 0.373 | 0.284 | 0.229 |
| 5.874778262212687 | 0.373 | 0.284 | 0.229 |
| 5.877919854866277 | 0.372 | 0.283 | 0.228 |
| 5.881061447519866 | 0.371 | 0.282 | 0.228 |
| 5.884203040173456 | 0.371 | 0.282 | 0.227 |
| 5.887344632827046 | 0.37 | 0.281 | 0.227 |
| 5.890486225480635 | 0.369 | 0.281 | 0.227 |
| 5.893627818134224 | 0.369 | 0.28 | 0.226 |
| 5.896769410787814 | 0.368 | 0.28 | 0.226 |
| 5.899911003441404 | 0.368 | 0.279 | 0.225 |
| 5.903052596094994 | 0.367 | 0.279 | 0.225 |
| 5.906194188748583 | 0.366 | 0.278 | 0.224 |
| 5.909335781402172 | 0.366 | 0.278 | 0.224 |
| 5.912477374055762 | 0.365 | 0.277 | 0.223 |
| 5.915618966709352 | 0.365 | 0.277 | 0.223 |
| 5.918760559362942 | 0.364 | 0.276 | 0.223 |
| 5.921902152016531 | 0.364 | 0.276 | 0.222 |
| 5.92504374467012 | 0.363 | 0.275 | 0.222 |
| 5.92818533732371 | 0.363 | 0.275 | 0.221 |
| 5.9313269299773 | 0.362 | 0.274 | 0.221 |
| 5.93446852263089 | 0.361 | 0.274 | 0.221 |
| 5.93761011528448 | 0.361 | 0.274 | 0.22 |
| 5.940751707938068 | 0.36 | 0.273 | 0.22 |
| 5.943893300591658 | 0.36 | 0.273 | 0.219 |
| 5.947034893245248 | 0.359 | 0.272 | 0.219 |
| 5.950176485898837 | 0.359 | 0.272 | 0.219 |
| 5.953318078552427 | 0.358 | 0.271 | 0.218 |
| 5.956459671206017 | 0.358 | 0.271 | 0.218 |
| 5.959601263859606 | 0.357 | 0.271 | 0.218 |
| 5.962742856513196 | 0.357 | 0.27 | 0.217 |
| 5.965884449166785 | 0.356 | 0.27 | 0.217 |
| 5.969026041820375 | 0.356 | 0.269 | 0.217 |
| 5.972167634473964 | 0.356 | 0.269 | 0.216 |
| 5.975309227127554 | 0.355 | 0.268 | 0.216 |
| 5.978450819781144 | 0.355 | 0.268 | 0.216 |
| 5.981592412434733 | 0.354 | 0.268 | 0.215 |
| 5.984734005088323 | 0.354 | 0.267 | 0.215 |
| 5.987875597741913 | 0.353 | 0.267 | 0.215 |
| 5.991017190395502 | 0.353 | 0.267 | 0.214 |
| 5.994158783049092 | 0.352 | 0.266 | 0.214 |
| 5.997300375702681 | 0.352 | 0.266 | 0.214 |
| 6.000441968356271 | 0.352 | 0.265 | 0.213 |
| 6.003583561009861 | 0.351 | 0.265 | 0.213 |
| 6.00672515366345 | 0.351 | 0.265 | 0.213 |
| 6.00986674631704 | 0.35 | 0.264 | 0.212 |
| 6.01300833897063 | 0.35 | 0.264 | 0.212 |
| 6.01614993162422 | 0.35 | 0.264 | 0.212 |
| 6.019291524277808 | 0.349 | 0.263 | 0.212 |
| 6.022433116931398 | 0.349 | 0.263 | 0.211 |
| 6.025574709584988 | 0.348 | 0.263 | 0.211 |
| 6.028716302238577 | 0.348 | 0.262 | 0.211 |
| 6.031857894892167 | 0.348 | 0.262 | 0.21 |
| 6.034999487545757 | 0.347 | 0.262 | 0.21 |
| 6.038141080199346 | 0.347 | 0.262 | 0.21 |
| 6.041282672852935 | 0.347 | 0.261 | 0.21 |
| 6.044424265506525 | 0.346 | 0.261 | 0.209 |
| 6.047565858160115 | 0.346 | 0.261 | 0.209 |
| 6.050707450813704 | 0.346 | 0.26 | 0.209 |
| 6.053849043467294 | 0.345 | 0.26 | 0.209 |
| 6.056990636120884 | 0.345 | 0.26 | 0.208 |
| 6.060132228774473 | 0.345 | 0.26 | 0.208 |
| 6.063273821428063 | 0.344 | 0.259 | 0.208 |
| 6.066415414081653 | 0.344 | 0.259 | 0.208 |
| 6.069557006735242 | 0.344 | 0.259 | 0.207 |
| 6.072698599388831 | 0.343 | 0.258 | 0.207 |
| 6.07584019204242 | 0.343 | 0.258 | 0.207 |
| 6.078981784696011 | 0.343 | 0.258 | 0.207 |
| 6.082123377349601 | 0.342 | 0.258 | 0.207 |
| 6.08526497000319 | 0.342 | 0.257 | 0.206 |
| 6.08840656265678 | 0.342 | 0.257 | 0.206 |
| 6.09154815531037 | 0.342 | 0.257 | 0.206 |
| 6.094689747963959 | 0.341 | 0.257 | 0.206 |
| 6.097831340617549 | 0.341 | 0.257 | 0.206 |
| 6.100972933271138 | 0.341 | 0.256 | 0.205 |
| 6.104114525924728 | 0.341 | 0.256 | 0.205 |
| 6.107256118578317 | 0.34 | 0.256 | 0.205 |
| 6.110397711231907 | 0.34 | 0.256 | 0.205 |
| 6.113539303885497 | 0.34 | 0.255 | 0.205 |
| 6.116680896539086 | 0.34 | 0.255 | 0.204 |
| 6.119822489192675 | 0.339 | 0.255 | 0.204 |
| 6.122964081846265 | 0.339 | 0.255 | 0.204 |
| 6.126105674499855 | 0.339 | 0.255 | 0.204 |
| 6.129247267153445 | 0.339 | 0.254 | 0.204 |
| 6.132388859807034 | 0.338 | 0.254 | 0.204 |
| 6.135530452460624 | 0.338 | 0.254 | 0.204 |
| 6.138672045114213 | 0.338 | 0.254 | 0.203 |
| 6.141813637767803 | 0.338 | 0.254 | 0.203 |
| 6.144955230421393 | 0.338 | 0.254 | 0.203 |
| 6.148096823074982 | 0.337 | 0.253 | 0.203 |
| 6.151238415728571 | 0.337 | 0.253 | 0.203 |
| 6.154380008382161 | 0.337 | 0.253 | 0.203 |
| 6.157521601035751 | 0.337 | 0.253 | 0.203 |
| 6.16066319368934 | 0.337 | 0.253 | 0.202 |
| 6.16380478634293 | 0.337 | 0.253 | 0.202 |
| 6.16694637899652 | 0.336 | 0.253 | 0.202 |
| 6.170087971650109 | 0.336 | 0.252 | 0.202 |
| 6.173229564303698 | 0.336 | 0.252 | 0.202 |
| 6.176371156957289 | 0.336 | 0.252 | 0.202 |
| 6.179512749610878 | 0.336 | 0.252 | 0.202 |
| 6.182654342264468 | 0.336 | 0.252 | 0.202 |
| 6.185795934918057 | 0.335 | 0.252 | 0.202 |
| 6.188937527571647 | 0.335 | 0.252 | 0.201 |
| 6.192079120225237 | 0.335 | 0.252 | 0.201 |
| 6.195220712878826 | 0.335 | 0.251 | 0.201 |
| 6.198362305532415 | 0.335 | 0.251 | 0.201 |
| 6.201503898186005 | 0.335 | 0.251 | 0.201 |
| 6.204645490839594 | 0.335 | 0.251 | 0.201 |
| 6.207787083493184 | 0.335 | 0.251 | 0.201 |
| 6.210928676146774 | 0.334 | 0.251 | 0.201 |
| 6.214070268800364 | 0.334 | 0.251 | 0.201 |
| 6.217211861453953 | 0.334 | 0.251 | 0.201 |
| 6.220353454107543 | 0.334 | 0.251 | 0.201 |
| 6.223495046761133 | 0.334 | 0.251 | 0.201 |
| 6.226636639414722 | 0.334 | 0.251 | 0.201 |
| 6.229778232068312 | 0.334 | 0.251 | 0.2 |
| 6.232919824721901 | 0.334 | 0.25 | 0.2 |
| 6.236061417375491 | 0.334 | 0.25 | 0.2 |
| 6.23920301002908 | 0.334 | 0.25 | 0.2 |
| 6.24234460268267 | 0.334 | 0.25 | 0.2 |
| 6.24548619533626 | 0.334 | 0.25 | 0.2 |
| 6.24862778798985 | 0.334 | 0.25 | 0.2 |
| 6.251769380643438 | 0.334 | 0.25 | 0.2 |
| 6.254910973297028 | 0.334 | 0.25 | 0.2 |
| 6.258052565950618 | 0.333 | 0.25 | 0.2 |
| 6.261194158604208 | 0.333 | 0.25 | 0.2 |
| 6.264335751257797 | 0.333 | 0.25 | 0.2 |
| 6.267477343911387 | 0.333 | 0.25 | 0.2 |
| 6.270618936564976 | 0.333 | 0.25 | 0.2 |
| 6.273760529218566 | 0.333 | 0.25 | 0.2 |
| 6.276902121872155 | 0.333 | 0.25 | 0.2 |
| 6.280043714525745 | 0.333 | 0.25 | 0.2 |
| 6.283185307179335 | 0.333 | 0.25 | 0.2 |